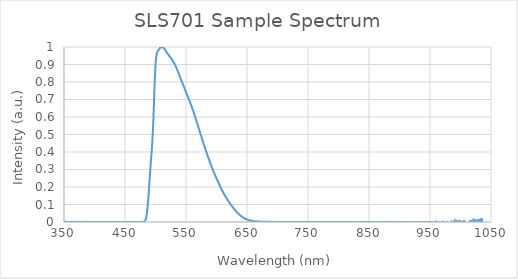
| Category | Intensity (a.u.) |
|---|---|
| 350.21 | 0 |
| 350.425 | 0.001 |
| 350.639 | 0.001 |
| 350.854 | 0.001 |
| 351.068 | 0 |
| 351.282 | 0.001 |
| 351.497 | 0.002 |
| 351.711 | 0.002 |
| 351.925 | 0.002 |
| 352.14 | 0.001 |
| 352.354 | 0.001 |
| 352.568 | 0 |
| 352.783 | 0 |
| 352.997 | 0 |
| 353.211 | 0.001 |
| 353.426 | 0.001 |
| 353.64 | 0.001 |
| 353.854 | 0.001 |
| 354.068 | 0.001 |
| 354.283 | 0.002 |
| 354.497 | 0.002 |
| 354.711 | 0.001 |
| 354.925 | 0.001 |
| 355.14 | 0 |
| 355.354 | 0.001 |
| 355.568 | 0 |
| 355.782 | 0 |
| 355.996 | 0 |
| 356.211 | 0 |
| 356.425 | 0 |
| 356.639 | 0.001 |
| 356.853 | 0.001 |
| 357.067 | 0 |
| 357.281 | 0 |
| 357.495 | 0 |
| 357.71 | 0 |
| 357.924 | 0 |
| 358.138 | 0.001 |
| 358.352 | 0.001 |
| 358.566 | 0.001 |
| 358.78 | 0 |
| 358.994 | 0 |
| 359.208 | 0 |
| 359.422 | 0 |
| 359.636 | 0 |
| 359.85 | 0 |
| 360.064 | 0 |
| 360.278 | 0.001 |
| 360.492 | 0.001 |
| 360.706 | 0.001 |
| 360.92 | 0.001 |
| 361.134 | 0.001 |
| 361.348 | 0.001 |
| 361.562 | 0 |
| 361.776 | 0 |
| 361.99 | 0 |
| 362.204 | -0.001 |
| 362.418 | 0 |
| 362.632 | 0 |
| 362.846 | 0 |
| 363.06 | 0.001 |
| 363.273 | 0 |
| 363.487 | 0 |
| 363.701 | 0 |
| 363.915 | 0.001 |
| 364.129 | 0.001 |
| 364.343 | 0.001 |
| 364.557 | 0 |
| 364.77 | 0 |
| 364.984 | 0.001 |
| 365.198 | 0.001 |
| 365.412 | 0.001 |
| 365.626 | 0 |
| 365.839 | -0.001 |
| 366.053 | 0 |
| 366.267 | 0 |
| 366.481 | 0.001 |
| 366.694 | 0.001 |
| 366.908 | 0.001 |
| 367.122 | 0 |
| 367.336 | 0.001 |
| 367.549 | 0.001 |
| 367.763 | 0.001 |
| 367.977 | 0 |
| 368.19 | 0.001 |
| 368.404 | 0.001 |
| 368.618 | 0.001 |
| 368.831 | 0 |
| 369.045 | 0.001 |
| 369.259 | 0 |
| 369.472 | 0 |
| 369.686 | 0 |
| 369.899 | 0 |
| 370.113 | 0 |
| 370.327 | 0.001 |
| 370.54 | 0.001 |
| 370.754 | 0.001 |
| 370.967 | 0.001 |
| 371.181 | 0.001 |
| 371.394 | 0.001 |
| 371.608 | 0.001 |
| 371.822 | 0.001 |
| 372.035 | 0.001 |
| 372.249 | 0.001 |
| 372.462 | 0.001 |
| 372.676 | 0 |
| 372.889 | 0 |
| 373.103 | 0 |
| 373.316 | 0 |
| 373.529 | 0.001 |
| 373.743 | 0 |
| 373.956 | 0 |
| 374.17 | 0 |
| 374.383 | 0.001 |
| 374.597 | 0.001 |
| 374.81 | 0.001 |
| 375.023 | 0.001 |
| 375.237 | 0.001 |
| 375.45 | 0.001 |
| 375.663 | 0 |
| 375.877 | 0 |
| 376.09 | 0 |
| 376.304 | 0 |
| 376.517 | 0.001 |
| 376.73 | 0.001 |
| 376.944 | 0 |
| 377.157 | 0 |
| 377.37 | 0 |
| 377.583 | 0 |
| 377.797 | 0.001 |
| 378.01 | 0.001 |
| 378.223 | 0.001 |
| 378.436 | 0 |
| 378.65 | 0 |
| 378.863 | -0.001 |
| 379.076 | -0.001 |
| 379.289 | 0 |
| 379.503 | 0 |
| 379.716 | 0 |
| 379.929 | -0.001 |
| 380.142 | 0 |
| 380.355 | 0 |
| 380.568 | 0 |
| 380.782 | -0.001 |
| 380.995 | -0.001 |
| 381.208 | 0 |
| 381.421 | 0 |
| 381.634 | 0 |
| 381.847 | 0 |
| 382.06 | 0 |
| 382.273 | 0.001 |
| 382.486 | 0.001 |
| 382.699 | 0.001 |
| 382.913 | 0.001 |
| 383.126 | 0 |
| 383.339 | -0.001 |
| 383.552 | 0 |
| 383.765 | 0 |
| 383.978 | 0 |
| 384.191 | 0.001 |
| 384.404 | 0.001 |
| 384.617 | 0.001 |
| 384.83 | 0 |
| 385.043 | 0 |
| 385.256 | 0.001 |
| 385.468 | 0.001 |
| 385.681 | 0 |
| 385.894 | 0 |
| 386.107 | 0 |
| 386.32 | 0.001 |
| 386.533 | 0.001 |
| 386.746 | 0 |
| 386.959 | 0 |
| 387.172 | 0 |
| 387.385 | 0 |
| 387.597 | 0.001 |
| 387.81 | 0.001 |
| 388.023 | 0.001 |
| 388.236 | 0.001 |
| 388.449 | 0 |
| 388.662 | 0 |
| 388.874 | 0 |
| 389.087 | 0.001 |
| 389.3 | 0.001 |
| 389.513 | 0.001 |
| 389.725 | 0.001 |
| 389.938 | 0 |
| 390.151 | 0.001 |
| 390.364 | 0 |
| 390.576 | 0 |
| 390.789 | 0 |
| 391.002 | 0 |
| 391.215 | 0 |
| 391.427 | 0 |
| 391.64 | 0 |
| 391.853 | 0 |
| 392.065 | 0 |
| 392.278 | 0.001 |
| 392.491 | 0.001 |
| 392.703 | 0.001 |
| 392.916 | 0 |
| 393.128 | 0 |
| 393.341 | 0 |
| 393.554 | -0.001 |
| 393.766 | -0.001 |
| 393.979 | 0 |
| 394.191 | 0 |
| 394.404 | 0 |
| 394.616 | 0 |
| 394.829 | 0.001 |
| 395.041 | 0 |
| 395.254 | 0 |
| 395.466 | 0 |
| 395.679 | 0 |
| 395.891 | 0.001 |
| 396.104 | 0 |
| 396.316 | 0 |
| 396.529 | 0 |
| 396.741 | 0 |
| 396.954 | 0 |
| 397.166 | 0 |
| 397.379 | 0 |
| 397.591 | 0 |
| 397.803 | 0 |
| 398.016 | 0 |
| 398.228 | 0 |
| 398.441 | 0 |
| 398.653 | 0 |
| 398.865 | 0 |
| 399.078 | 0 |
| 399.29 | 0 |
| 399.502 | 0 |
| 399.715 | 0 |
| 399.927 | 0 |
| 400.139 | 0 |
| 400.352 | 0 |
| 400.564 | 0 |
| 400.776 | 0 |
| 400.988 | 0 |
| 401.201 | 0 |
| 401.413 | 0 |
| 401.625 | 0 |
| 401.837 | 0 |
| 402.05 | 0 |
| 402.262 | 0 |
| 402.474 | 0 |
| 402.686 | 0 |
| 402.898 | 0.001 |
| 403.111 | 0 |
| 403.323 | 0 |
| 403.535 | 0 |
| 403.747 | 0 |
| 403.959 | 0 |
| 404.171 | 0 |
| 404.383 | 0 |
| 404.595 | 0 |
| 404.808 | 0 |
| 405.02 | 0 |
| 405.232 | 0 |
| 405.444 | 0 |
| 405.656 | 0 |
| 405.868 | 0.001 |
| 406.08 | 0.001 |
| 406.292 | 0 |
| 406.504 | 0 |
| 406.716 | 0 |
| 406.928 | 0 |
| 407.14 | 0 |
| 407.352 | 0 |
| 407.564 | 0 |
| 407.776 | 0 |
| 407.988 | 0 |
| 408.2 | 0 |
| 408.412 | 0 |
| 408.624 | 0 |
| 408.835 | 0 |
| 409.047 | 0 |
| 409.259 | 0 |
| 409.471 | 0 |
| 409.683 | 0 |
| 409.895 | 0 |
| 410.107 | 0 |
| 410.319 | 0 |
| 410.53 | 0 |
| 410.742 | 0 |
| 410.954 | 0 |
| 411.166 | 0 |
| 411.378 | 0 |
| 411.589 | 0 |
| 411.801 | 0 |
| 412.013 | 0 |
| 412.225 | 0 |
| 412.436 | 0 |
| 412.648 | 0 |
| 412.86 | 0 |
| 413.072 | 0 |
| 413.283 | 0 |
| 413.495 | 0 |
| 413.707 | 0.001 |
| 413.918 | 0 |
| 414.13 | 0 |
| 414.342 | 0 |
| 414.553 | 0 |
| 414.765 | 0 |
| 414.977 | 0 |
| 415.188 | 0 |
| 415.4 | 0 |
| 415.611 | 0 |
| 415.823 | 0 |
| 416.035 | 0 |
| 416.246 | 0 |
| 416.458 | 0 |
| 416.669 | 0 |
| 416.881 | 0 |
| 417.092 | 0 |
| 417.304 | 0 |
| 417.515 | 0 |
| 417.727 | 0 |
| 417.938 | 0 |
| 418.15 | 0 |
| 418.361 | 0 |
| 418.573 | 0 |
| 418.784 | 0 |
| 418.996 | 0 |
| 419.207 | 0 |
| 419.419 | 0 |
| 419.63 | 0 |
| 419.841 | 0 |
| 420.053 | 0 |
| 420.264 | 0 |
| 420.475 | 0 |
| 420.687 | 0 |
| 420.898 | 0 |
| 421.11 | 0 |
| 421.321 | 0.001 |
| 421.532 | 0 |
| 421.744 | 0 |
| 421.955 | 0 |
| 422.166 | 0 |
| 422.377 | 0 |
| 422.589 | 0 |
| 422.8 | 0 |
| 423.011 | 0 |
| 423.222 | 0 |
| 423.434 | 0 |
| 423.645 | 0 |
| 423.856 | 0 |
| 424.067 | 0 |
| 424.279 | 0 |
| 424.49 | 0 |
| 424.701 | 0 |
| 424.912 | 0 |
| 425.123 | 0 |
| 425.334 | 0 |
| 425.545 | 0 |
| 425.757 | 0 |
| 425.968 | 0 |
| 426.179 | 0 |
| 426.39 | 0 |
| 426.601 | 0.001 |
| 426.812 | 0.001 |
| 427.023 | 0 |
| 427.234 | 0 |
| 427.445 | 0 |
| 427.656 | 0 |
| 427.867 | 0 |
| 428.078 | 0 |
| 428.289 | 0 |
| 428.5 | 0 |
| 428.711 | 0 |
| 428.922 | 0 |
| 429.133 | 0 |
| 429.344 | 0 |
| 429.555 | 0 |
| 429.766 | 0 |
| 429.977 | 0 |
| 430.188 | 0 |
| 430.399 | 0 |
| 430.61 | 0 |
| 430.821 | 0 |
| 431.031 | 0 |
| 431.242 | 0 |
| 431.453 | 0 |
| 431.664 | 0 |
| 431.875 | 0 |
| 432.086 | 0 |
| 432.297 | 0 |
| 432.507 | 0 |
| 432.718 | 0 |
| 432.929 | 0 |
| 433.14 | 0 |
| 433.35 | 0 |
| 433.561 | 0 |
| 433.772 | 0 |
| 433.983 | 0 |
| 434.193 | 0 |
| 434.404 | 0 |
| 434.615 | 0 |
| 434.826 | 0 |
| 435.036 | 0 |
| 435.247 | 0 |
| 435.458 | 0 |
| 435.668 | 0 |
| 435.879 | 0 |
| 436.09 | 0 |
| 436.3 | 0 |
| 436.511 | 0 |
| 436.721 | 0 |
| 436.932 | 0 |
| 437.143 | 0 |
| 437.353 | 0 |
| 437.564 | 0 |
| 437.774 | 0 |
| 437.985 | 0 |
| 438.195 | 0 |
| 438.406 | 0 |
| 438.616 | 0 |
| 438.827 | 0 |
| 439.037 | 0 |
| 439.248 | 0 |
| 439.458 | 0 |
| 439.669 | 0 |
| 439.879 | 0 |
| 440.09 | 0 |
| 440.3 | 0 |
| 440.51 | 0 |
| 440.721 | 0 |
| 440.931 | 0 |
| 441.142 | 0 |
| 441.352 | 0 |
| 441.562 | 0 |
| 441.773 | 0 |
| 441.983 | 0 |
| 442.193 | 0 |
| 442.404 | 0 |
| 442.614 | 0 |
| 442.824 | 0 |
| 443.035 | 0 |
| 443.245 | 0 |
| 443.455 | 0 |
| 443.666 | 0 |
| 443.876 | 0 |
| 444.086 | 0 |
| 444.296 | 0 |
| 444.507 | 0 |
| 444.717 | 0 |
| 444.927 | 0 |
| 445.137 | 0 |
| 445.347 | 0 |
| 445.558 | 0 |
| 445.768 | 0 |
| 445.978 | 0 |
| 446.188 | 0 |
| 446.398 | 0 |
| 446.608 | 0 |
| 446.818 | 0 |
| 447.028 | 0 |
| 447.239 | 0 |
| 447.449 | 0 |
| 447.659 | 0 |
| 447.869 | 0 |
| 448.079 | 0 |
| 448.289 | 0 |
| 448.499 | 0 |
| 448.709 | 0 |
| 448.919 | 0 |
| 449.129 | 0 |
| 449.339 | 0 |
| 449.549 | 0 |
| 449.759 | 0 |
| 449.969 | 0 |
| 450.179 | 0 |
| 450.389 | 0 |
| 450.599 | 0 |
| 450.809 | 0 |
| 451.018 | 0 |
| 451.228 | 0 |
| 451.438 | 0 |
| 451.648 | 0 |
| 451.858 | 0 |
| 452.068 | 0 |
| 452.278 | 0 |
| 452.487 | 0 |
| 452.697 | 0 |
| 452.907 | 0 |
| 453.117 | 0 |
| 453.327 | 0 |
| 453.536 | 0 |
| 453.746 | 0 |
| 453.956 | 0 |
| 454.166 | 0 |
| 454.376 | 0 |
| 454.585 | 0 |
| 454.795 | 0 |
| 455.005 | 0 |
| 455.214 | 0 |
| 455.424 | 0 |
| 455.634 | 0 |
| 455.843 | 0 |
| 456.053 | 0 |
| 456.263 | 0 |
| 456.472 | 0 |
| 456.682 | 0 |
| 456.892 | 0 |
| 457.101 | 0 |
| 457.311 | 0 |
| 457.52 | 0 |
| 457.73 | 0 |
| 457.939 | 0 |
| 458.149 | 0 |
| 458.359 | 0 |
| 458.568 | 0 |
| 458.778 | 0 |
| 458.987 | 0 |
| 459.197 | 0 |
| 459.406 | 0 |
| 459.616 | 0 |
| 459.825 | 0 |
| 460.034 | 0 |
| 460.244 | 0 |
| 460.453 | 0 |
| 460.663 | 0 |
| 460.872 | 0 |
| 461.082 | 0 |
| 461.291 | 0 |
| 461.5 | 0 |
| 461.71 | 0 |
| 461.919 | 0 |
| 462.128 | 0 |
| 462.338 | 0 |
| 462.547 | 0 |
| 462.756 | 0 |
| 462.966 | 0 |
| 463.175 | 0 |
| 463.384 | 0 |
| 463.594 | 0 |
| 463.803 | 0 |
| 464.012 | 0 |
| 464.221 | 0 |
| 464.431 | 0 |
| 464.64 | 0 |
| 464.849 | 0 |
| 465.058 | 0 |
| 465.267 | 0 |
| 465.477 | 0 |
| 465.686 | 0 |
| 465.895 | 0 |
| 466.104 | 0 |
| 466.313 | 0 |
| 466.522 | 0 |
| 466.731 | 0 |
| 466.941 | 0 |
| 467.15 | 0 |
| 467.359 | 0 |
| 467.568 | 0 |
| 467.777 | 0 |
| 467.986 | 0 |
| 468.195 | 0 |
| 468.404 | 0 |
| 468.613 | 0 |
| 468.822 | 0 |
| 469.031 | 0 |
| 469.24 | 0 |
| 469.449 | 0 |
| 469.658 | 0 |
| 469.867 | 0 |
| 470.076 | 0 |
| 470.285 | 0 |
| 470.494 | 0 |
| 470.703 | 0 |
| 470.912 | 0 |
| 471.12 | 0 |
| 471.329 | 0 |
| 471.538 | 0 |
| 471.747 | 0 |
| 471.956 | 0 |
| 472.165 | 0 |
| 472.374 | 0 |
| 472.582 | 0 |
| 472.791 | 0 |
| 473.0 | 0 |
| 473.209 | 0 |
| 473.417 | 0 |
| 473.626 | 0 |
| 473.835 | 0 |
| 474.044 | 0 |
| 474.252 | 0 |
| 474.461 | 0 |
| 474.67 | 0 |
| 474.879 | 0 |
| 475.087 | 0 |
| 475.296 | 0 |
| 475.505 | 0 |
| 475.713 | 0 |
| 475.922 | 0 |
| 476.131 | 0 |
| 476.339 | 0 |
| 476.548 | 0 |
| 476.756 | 0 |
| 476.965 | 0 |
| 477.174 | 0 |
| 477.382 | 0 |
| 477.591 | 0 |
| 477.799 | 0 |
| 478.008 | 0 |
| 478.216 | 0.001 |
| 478.425 | 0.001 |
| 478.633 | 0.001 |
| 478.842 | 0.001 |
| 479.05 | 0.001 |
| 479.259 | 0.001 |
| 479.467 | 0.001 |
| 479.676 | 0.001 |
| 479.884 | 0.001 |
| 480.092 | 0.001 |
| 480.301 | 0.002 |
| 480.509 | 0.002 |
| 480.718 | 0.002 |
| 480.926 | 0.002 |
| 481.134 | 0.003 |
| 481.343 | 0.003 |
| 481.551 | 0.003 |
| 481.759 | 0.004 |
| 481.968 | 0.004 |
| 482.176 | 0.005 |
| 482.384 | 0.005 |
| 482.593 | 0.006 |
| 482.801 | 0.007 |
| 483.009 | 0.008 |
| 483.218 | 0.009 |
| 483.426 | 0.011 |
| 483.634 | 0.012 |
| 483.842 | 0.015 |
| 484.05 | 0.017 |
| 484.259 | 0.02 |
| 484.467 | 0.022 |
| 484.675 | 0.025 |
| 484.883 | 0.028 |
| 485.091 | 0.033 |
| 485.3 | 0.037 |
| 485.508 | 0.042 |
| 485.716 | 0.046 |
| 485.924 | 0.052 |
| 486.132 | 0.058 |
| 486.34 | 0.064 |
| 486.548 | 0.07 |
| 486.756 | 0.078 |
| 486.964 | 0.085 |
| 487.172 | 0.092 |
| 487.38 | 0.1 |
| 487.588 | 0.108 |
| 487.796 | 0.117 |
| 488.004 | 0.126 |
| 488.212 | 0.135 |
| 488.42 | 0.145 |
| 488.628 | 0.154 |
| 488.836 | 0.164 |
| 489.044 | 0.174 |
| 489.252 | 0.185 |
| 489.46 | 0.195 |
| 489.668 | 0.207 |
| 489.876 | 0.217 |
| 490.084 | 0.228 |
| 490.292 | 0.238 |
| 490.5 | 0.249 |
| 490.708 | 0.261 |
| 490.915 | 0.271 |
| 491.123 | 0.282 |
| 491.331 | 0.293 |
| 491.539 | 0.303 |
| 491.747 | 0.314 |
| 491.954 | 0.323 |
| 492.162 | 0.333 |
| 492.37 | 0.342 |
| 492.578 | 0.352 |
| 492.786 | 0.361 |
| 492.993 | 0.372 |
| 493.201 | 0.381 |
| 493.409 | 0.39 |
| 493.616 | 0.401 |
| 493.824 | 0.41 |
| 494.032 | 0.421 |
| 494.239 | 0.431 |
| 494.447 | 0.442 |
| 494.655 | 0.452 |
| 494.862 | 0.464 |
| 495.07 | 0.478 |
| 495.278 | 0.49 |
| 495.485 | 0.504 |
| 495.693 | 0.52 |
| 495.9 | 0.535 |
| 496.108 | 0.552 |
| 496.316 | 0.569 |
| 496.523 | 0.586 |
| 496.731 | 0.606 |
| 496.938 | 0.626 |
| 497.146 | 0.647 |
| 497.353 | 0.666 |
| 497.561 | 0.687 |
| 497.768 | 0.709 |
| 497.976 | 0.728 |
| 498.183 | 0.751 |
| 498.391 | 0.771 |
| 498.598 | 0.789 |
| 498.805 | 0.808 |
| 499.013 | 0.824 |
| 499.22 | 0.845 |
| 499.428 | 0.857 |
| 499.635 | 0.873 |
| 499.842 | 0.884 |
| 500.05 | 0.896 |
| 500.257 | 0.909 |
| 500.464 | 0.919 |
| 500.672 | 0.927 |
| 500.879 | 0.935 |
| 501.086 | 0.942 |
| 501.294 | 0.944 |
| 501.501 | 0.949 |
| 501.708 | 0.954 |
| 501.915 | 0.96 |
| 502.123 | 0.962 |
| 502.33 | 0.963 |
| 502.537 | 0.967 |
| 502.744 | 0.967 |
| 502.952 | 0.969 |
| 503.159 | 0.971 |
| 503.366 | 0.971 |
| 503.573 | 0.977 |
| 503.78 | 0.977 |
| 503.987 | 0.977 |
| 504.195 | 0.976 |
| 504.402 | 0.979 |
| 504.609 | 0.98 |
| 504.816 | 0.981 |
| 505.023 | 0.983 |
| 505.23 | 0.986 |
| 505.437 | 0.986 |
| 505.644 | 0.987 |
| 505.851 | 0.987 |
| 506.058 | 0.988 |
| 506.265 | 0.988 |
| 506.472 | 0.988 |
| 506.679 | 0.99 |
| 506.886 | 0.991 |
| 507.093 | 0.991 |
| 507.3 | 0.993 |
| 507.507 | 0.996 |
| 507.714 | 0.996 |
| 507.921 | 0.994 |
| 508.128 | 0.993 |
| 508.335 | 0.993 |
| 508.542 | 0.995 |
| 508.749 | 0.998 |
| 508.955 | 0.999 |
| 509.162 | 0.999 |
| 509.369 | 0.998 |
| 509.576 | 0.999 |
| 509.783 | 0.997 |
| 509.99 | 0.996 |
| 510.196 | 0.997 |
| 510.403 | 0.999 |
| 510.61 | 0.998 |
| 510.817 | 0.999 |
| 511.023 | 1 |
| 511.23 | 0.999 |
| 511.437 | 0.997 |
| 511.644 | 0.996 |
| 511.85 | 0.996 |
| 512.057 | 0.998 |
| 512.264 | 0.999 |
| 512.47 | 1 |
| 512.677 | 0.998 |
| 512.884 | 0.998 |
| 513.09 | 0.995 |
| 513.297 | 0.994 |
| 513.504 | 0.992 |
| 513.71 | 0.994 |
| 513.917 | 0.994 |
| 514.123 | 0.994 |
| 514.33 | 0.993 |
| 514.537 | 0.989 |
| 514.743 | 0.989 |
| 514.95 | 0.988 |
| 515.156 | 0.989 |
| 515.363 | 0.986 |
| 515.569 | 0.988 |
| 515.776 | 0.984 |
| 515.982 | 0.985 |
| 516.189 | 0.983 |
| 516.395 | 0.982 |
| 516.601 | 0.981 |
| 516.808 | 0.979 |
| 517.014 | 0.977 |
| 517.221 | 0.977 |
| 517.427 | 0.977 |
| 517.634 | 0.977 |
| 517.84 | 0.973 |
| 518.046 | 0.972 |
| 518.253 | 0.97 |
| 518.459 | 0.968 |
| 518.665 | 0.967 |
| 518.872 | 0.966 |
| 519.078 | 0.967 |
| 519.284 | 0.967 |
| 519.49 | 0.964 |
| 519.697 | 0.963 |
| 519.903 | 0.961 |
| 520.109 | 0.96 |
| 520.315 | 0.958 |
| 520.522 | 0.958 |
| 520.728 | 0.956 |
| 520.934 | 0.957 |
| 521.14 | 0.957 |
| 521.346 | 0.956 |
| 521.553 | 0.955 |
| 521.759 | 0.952 |
| 521.965 | 0.951 |
| 522.171 | 0.949 |
| 522.377 | 0.95 |
| 522.583 | 0.948 |
| 522.789 | 0.946 |
| 522.995 | 0.947 |
| 523.202 | 0.946 |
| 523.408 | 0.946 |
| 523.614 | 0.946 |
| 523.82 | 0.942 |
| 524.026 | 0.943 |
| 524.232 | 0.94 |
| 524.438 | 0.942 |
| 524.644 | 0.94 |
| 524.85 | 0.939 |
| 525.056 | 0.94 |
| 525.262 | 0.938 |
| 525.468 | 0.937 |
| 525.673 | 0.938 |
| 525.879 | 0.936 |
| 526.085 | 0.933 |
| 526.291 | 0.932 |
| 526.497 | 0.931 |
| 526.703 | 0.931 |
| 526.909 | 0.93 |
| 527.115 | 0.93 |
| 527.32 | 0.927 |
| 527.526 | 0.926 |
| 527.732 | 0.927 |
| 527.938 | 0.925 |
| 528.144 | 0.923 |
| 528.349 | 0.921 |
| 528.555 | 0.922 |
| 528.761 | 0.918 |
| 528.967 | 0.92 |
| 529.172 | 0.918 |
| 529.378 | 0.916 |
| 529.584 | 0.915 |
| 529.79 | 0.914 |
| 529.995 | 0.913 |
| 530.201 | 0.91 |
| 530.407 | 0.911 |
| 530.612 | 0.911 |
| 530.818 | 0.907 |
| 531.023 | 0.907 |
| 531.229 | 0.905 |
| 531.435 | 0.904 |
| 531.64 | 0.901 |
| 531.846 | 0.9 |
| 532.051 | 0.898 |
| 532.257 | 0.896 |
| 532.462 | 0.896 |
| 532.668 | 0.895 |
| 532.874 | 0.892 |
| 533.079 | 0.892 |
| 533.285 | 0.889 |
| 533.49 | 0.889 |
| 533.695 | 0.885 |
| 533.901 | 0.886 |
| 534.106 | 0.884 |
| 534.312 | 0.882 |
| 534.517 | 0.879 |
| 534.723 | 0.878 |
| 534.928 | 0.875 |
| 535.133 | 0.875 |
| 535.339 | 0.871 |
| 535.544 | 0.871 |
| 535.749 | 0.868 |
| 535.955 | 0.866 |
| 536.16 | 0.866 |
| 536.365 | 0.864 |
| 536.571 | 0.862 |
| 536.776 | 0.86 |
| 536.981 | 0.857 |
| 537.187 | 0.857 |
| 537.392 | 0.853 |
| 537.597 | 0.853 |
| 537.802 | 0.849 |
| 538.008 | 0.85 |
| 538.213 | 0.848 |
| 538.418 | 0.847 |
| 538.623 | 0.844 |
| 538.828 | 0.841 |
| 539.033 | 0.839 |
| 539.239 | 0.837 |
| 539.444 | 0.836 |
| 539.649 | 0.834 |
| 539.854 | 0.832 |
| 540.059 | 0.831 |
| 540.264 | 0.828 |
| 540.469 | 0.826 |
| 540.674 | 0.824 |
| 540.879 | 0.823 |
| 541.084 | 0.82 |
| 541.289 | 0.82 |
| 541.494 | 0.817 |
| 541.699 | 0.816 |
| 541.904 | 0.812 |
| 542.109 | 0.811 |
| 542.314 | 0.809 |
| 542.519 | 0.809 |
| 542.724 | 0.807 |
| 542.929 | 0.805 |
| 543.134 | 0.804 |
| 543.339 | 0.8 |
| 543.544 | 0.798 |
| 543.749 | 0.796 |
| 543.954 | 0.796 |
| 544.158 | 0.795 |
| 544.363 | 0.793 |
| 544.568 | 0.792 |
| 544.773 | 0.788 |
| 544.978 | 0.788 |
| 545.183 | 0.785 |
| 545.387 | 0.784 |
| 545.592 | 0.781 |
| 545.797 | 0.78 |
| 546.002 | 0.78 |
| 546.206 | 0.778 |
| 546.411 | 0.775 |
| 546.616 | 0.773 |
| 546.82 | 0.771 |
| 547.025 | 0.77 |
| 547.23 | 0.767 |
| 547.434 | 0.766 |
| 547.639 | 0.764 |
| 547.844 | 0.762 |
| 548.048 | 0.759 |
| 548.253 | 0.758 |
| 548.458 | 0.755 |
| 548.662 | 0.754 |
| 548.867 | 0.752 |
| 549.071 | 0.75 |
| 549.276 | 0.749 |
| 549.48 | 0.746 |
| 549.685 | 0.745 |
| 549.889 | 0.741 |
| 550.094 | 0.74 |
| 550.298 | 0.738 |
| 550.503 | 0.736 |
| 550.707 | 0.734 |
| 550.912 | 0.733 |
| 551.116 | 0.733 |
| 551.321 | 0.73 |
| 551.525 | 0.728 |
| 551.73 | 0.725 |
| 551.934 | 0.724 |
| 552.138 | 0.722 |
| 552.343 | 0.721 |
| 552.547 | 0.718 |
| 552.751 | 0.718 |
| 552.956 | 0.715 |
| 553.16 | 0.715 |
| 553.364 | 0.711 |
| 553.569 | 0.71 |
| 553.773 | 0.709 |
| 553.977 | 0.708 |
| 554.181 | 0.707 |
| 554.386 | 0.703 |
| 554.59 | 0.701 |
| 554.794 | 0.699 |
| 554.998 | 0.697 |
| 555.203 | 0.697 |
| 555.407 | 0.696 |
| 555.611 | 0.694 |
| 555.815 | 0.692 |
| 556.019 | 0.69 |
| 556.223 | 0.688 |
| 556.427 | 0.686 |
| 556.632 | 0.684 |
| 556.836 | 0.682 |
| 557.04 | 0.681 |
| 557.244 | 0.679 |
| 557.448 | 0.676 |
| 557.652 | 0.676 |
| 557.856 | 0.671 |
| 558.06 | 0.672 |
| 558.264 | 0.667 |
| 558.468 | 0.667 |
| 558.672 | 0.665 |
| 558.876 | 0.665 |
| 559.08 | 0.662 |
| 559.284 | 0.66 |
| 559.488 | 0.657 |
| 559.692 | 0.655 |
| 559.896 | 0.651 |
| 560.1 | 0.651 |
| 560.303 | 0.65 |
| 560.507 | 0.648 |
| 560.711 | 0.646 |
| 560.915 | 0.644 |
| 561.119 | 0.641 |
| 561.323 | 0.639 |
| 561.527 | 0.638 |
| 561.73 | 0.637 |
| 561.934 | 0.634 |
| 562.138 | 0.631 |
| 562.342 | 0.629 |
| 562.545 | 0.628 |
| 562.749 | 0.626 |
| 562.953 | 0.622 |
| 563.157 | 0.62 |
| 563.36 | 0.617 |
| 563.564 | 0.616 |
| 563.768 | 0.613 |
| 563.971 | 0.611 |
| 564.175 | 0.61 |
| 564.379 | 0.607 |
| 564.582 | 0.606 |
| 564.786 | 0.604 |
| 564.989 | 0.602 |
| 565.193 | 0.598 |
| 565.397 | 0.596 |
| 565.6 | 0.593 |
| 565.804 | 0.592 |
| 566.007 | 0.591 |
| 566.211 | 0.587 |
| 566.414 | 0.586 |
| 566.618 | 0.582 |
| 566.821 | 0.581 |
| 567.025 | 0.579 |
| 567.228 | 0.576 |
| 567.432 | 0.576 |
| 567.635 | 0.569 |
| 567.839 | 0.569 |
| 568.042 | 0.565 |
| 568.245 | 0.565 |
| 568.449 | 0.563 |
| 568.652 | 0.561 |
| 568.855 | 0.56 |
| 569.059 | 0.556 |
| 569.262 | 0.554 |
| 569.466 | 0.551 |
| 569.669 | 0.549 |
| 569.872 | 0.548 |
| 570.075 | 0.545 |
| 570.279 | 0.543 |
| 570.482 | 0.539 |
| 570.685 | 0.537 |
| 570.888 | 0.535 |
| 571.092 | 0.534 |
| 571.295 | 0.532 |
| 571.498 | 0.529 |
| 571.701 | 0.527 |
| 571.904 | 0.524 |
| 572.108 | 0.521 |
| 572.311 | 0.519 |
| 572.514 | 0.517 |
| 572.717 | 0.516 |
| 572.92 | 0.514 |
| 573.123 | 0.511 |
| 573.326 | 0.508 |
| 573.529 | 0.505 |
| 573.732 | 0.504 |
| 573.935 | 0.502 |
| 574.139 | 0.5 |
| 574.342 | 0.497 |
| 574.545 | 0.495 |
| 574.748 | 0.492 |
| 574.951 | 0.49 |
| 575.154 | 0.489 |
| 575.356 | 0.487 |
| 575.559 | 0.485 |
| 575.762 | 0.483 |
| 575.965 | 0.48 |
| 576.168 | 0.477 |
| 576.371 | 0.475 |
| 576.574 | 0.473 |
| 576.777 | 0.471 |
| 576.98 | 0.468 |
| 577.183 | 0.466 |
| 577.385 | 0.464 |
| 577.588 | 0.462 |
| 577.791 | 0.459 |
| 577.994 | 0.457 |
| 578.197 | 0.455 |
| 578.399 | 0.453 |
| 578.602 | 0.451 |
| 578.805 | 0.449 |
| 579.008 | 0.445 |
| 579.21 | 0.445 |
| 579.413 | 0.442 |
| 579.616 | 0.441 |
| 579.818 | 0.437 |
| 580.021 | 0.436 |
| 580.224 | 0.433 |
| 580.426 | 0.431 |
| 580.629 | 0.429 |
| 580.832 | 0.428 |
| 581.034 | 0.425 |
| 581.237 | 0.423 |
| 581.439 | 0.42 |
| 581.642 | 0.418 |
| 581.844 | 0.415 |
| 582.047 | 0.414 |
| 582.25 | 0.411 |
| 582.452 | 0.409 |
| 582.655 | 0.406 |
| 582.857 | 0.406 |
| 583.06 | 0.403 |
| 583.262 | 0.403 |
| 583.464 | 0.399 |
| 583.667 | 0.397 |
| 583.869 | 0.394 |
| 584.072 | 0.393 |
| 584.274 | 0.39 |
| 584.476 | 0.388 |
| 584.679 | 0.387 |
| 584.881 | 0.384 |
| 585.084 | 0.382 |
| 585.286 | 0.38 |
| 585.488 | 0.378 |
| 585.691 | 0.377 |
| 585.893 | 0.374 |
| 586.095 | 0.373 |
| 586.297 | 0.37 |
| 586.5 | 0.368 |
| 586.702 | 0.366 |
| 586.904 | 0.364 |
| 587.106 | 0.362 |
| 587.309 | 0.359 |
| 587.511 | 0.357 |
| 587.713 | 0.356 |
| 587.915 | 0.354 |
| 588.117 | 0.352 |
| 588.319 | 0.35 |
| 588.521 | 0.348 |
| 588.724 | 0.347 |
| 588.926 | 0.344 |
| 589.128 | 0.342 |
| 589.33 | 0.341 |
| 589.532 | 0.339 |
| 589.734 | 0.338 |
| 589.936 | 0.335 |
| 590.138 | 0.333 |
| 590.34 | 0.331 |
| 590.542 | 0.33 |
| 590.744 | 0.327 |
| 590.946 | 0.326 |
| 591.148 | 0.324 |
| 591.35 | 0.323 |
| 591.552 | 0.32 |
| 591.754 | 0.319 |
| 591.956 | 0.317 |
| 592.158 | 0.315 |
| 592.359 | 0.313 |
| 592.561 | 0.311 |
| 592.763 | 0.31 |
| 592.965 | 0.308 |
| 593.167 | 0.306 |
| 593.369 | 0.304 |
| 593.57 | 0.302 |
| 593.772 | 0.3 |
| 593.974 | 0.3 |
| 594.176 | 0.298 |
| 594.378 | 0.296 |
| 594.579 | 0.294 |
| 594.781 | 0.292 |
| 594.983 | 0.291 |
| 595.184 | 0.288 |
| 595.386 | 0.287 |
| 595.588 | 0.285 |
| 595.789 | 0.285 |
| 595.991 | 0.283 |
| 596.193 | 0.281 |
| 596.394 | 0.279 |
| 596.596 | 0.277 |
| 596.798 | 0.275 |
| 596.999 | 0.274 |
| 597.201 | 0.272 |
| 597.402 | 0.271 |
| 597.604 | 0.269 |
| 597.805 | 0.268 |
| 598.007 | 0.266 |
| 598.208 | 0.264 |
| 598.41 | 0.262 |
| 598.611 | 0.261 |
| 598.813 | 0.259 |
| 599.014 | 0.257 |
| 599.216 | 0.255 |
| 599.417 | 0.254 |
| 599.618 | 0.252 |
| 599.82 | 0.251 |
| 600.021 | 0.249 |
| 600.223 | 0.247 |
| 600.424 | 0.246 |
| 600.625 | 0.245 |
| 600.827 | 0.243 |
| 601.028 | 0.241 |
| 601.229 | 0.239 |
| 601.431 | 0.238 |
| 601.632 | 0.236 |
| 601.833 | 0.235 |
| 602.034 | 0.233 |
| 602.236 | 0.232 |
| 602.437 | 0.23 |
| 602.638 | 0.229 |
| 602.839 | 0.227 |
| 603.04 | 0.226 |
| 603.242 | 0.224 |
| 603.443 | 0.222 |
| 603.644 | 0.22 |
| 603.845 | 0.219 |
| 604.046 | 0.218 |
| 604.247 | 0.217 |
| 604.448 | 0.215 |
| 604.649 | 0.213 |
| 604.851 | 0.212 |
| 605.052 | 0.211 |
| 605.253 | 0.209 |
| 605.454 | 0.207 |
| 605.655 | 0.206 |
| 605.856 | 0.204 |
| 606.057 | 0.203 |
| 606.258 | 0.202 |
| 606.459 | 0.2 |
| 606.66 | 0.198 |
| 606.86 | 0.197 |
| 607.061 | 0.196 |
| 607.262 | 0.194 |
| 607.463 | 0.193 |
| 607.664 | 0.191 |
| 607.865 | 0.191 |
| 608.066 | 0.188 |
| 608.267 | 0.187 |
| 608.467 | 0.185 |
| 608.668 | 0.185 |
| 608.869 | 0.183 |
| 609.07 | 0.181 |
| 609.271 | 0.18 |
| 609.471 | 0.179 |
| 609.672 | 0.177 |
| 609.873 | 0.176 |
| 610.074 | 0.175 |
| 610.274 | 0.173 |
| 610.475 | 0.173 |
| 610.676 | 0.171 |
| 610.876 | 0.17 |
| 611.077 | 0.169 |
| 611.278 | 0.167 |
| 611.478 | 0.166 |
| 611.679 | 0.164 |
| 611.88 | 0.163 |
| 612.08 | 0.162 |
| 612.281 | 0.161 |
| 612.481 | 0.16 |
| 612.682 | 0.158 |
| 612.882 | 0.157 |
| 613.083 | 0.156 |
| 613.283 | 0.155 |
| 613.484 | 0.154 |
| 613.684 | 0.152 |
| 613.885 | 0.151 |
| 614.085 | 0.149 |
| 614.286 | 0.149 |
| 614.486 | 0.148 |
| 614.687 | 0.146 |
| 614.887 | 0.145 |
| 615.087 | 0.144 |
| 615.288 | 0.143 |
| 615.488 | 0.142 |
| 615.688 | 0.141 |
| 615.889 | 0.14 |
| 616.089 | 0.139 |
| 616.289 | 0.138 |
| 616.49 | 0.136 |
| 616.69 | 0.135 |
| 616.89 | 0.134 |
| 617.09 | 0.133 |
| 617.291 | 0.131 |
| 617.491 | 0.131 |
| 617.691 | 0.13 |
| 617.891 | 0.128 |
| 618.092 | 0.127 |
| 618.292 | 0.126 |
| 618.492 | 0.125 |
| 618.692 | 0.124 |
| 618.892 | 0.123 |
| 619.092 | 0.122 |
| 619.292 | 0.121 |
| 619.492 | 0.12 |
| 619.693 | 0.118 |
| 619.893 | 0.118 |
| 620.093 | 0.117 |
| 620.293 | 0.116 |
| 620.493 | 0.115 |
| 620.693 | 0.114 |
| 620.893 | 0.112 |
| 621.093 | 0.112 |
| 621.293 | 0.11 |
| 621.493 | 0.11 |
| 621.693 | 0.108 |
| 621.893 | 0.107 |
| 622.092 | 0.106 |
| 622.292 | 0.105 |
| 622.492 | 0.104 |
| 622.692 | 0.103 |
| 622.892 | 0.102 |
| 623.092 | 0.101 |
| 623.292 | 0.1 |
| 623.491 | 0.1 |
| 623.691 | 0.098 |
| 623.891 | 0.097 |
| 624.091 | 0.096 |
| 624.291 | 0.095 |
| 624.49 | 0.094 |
| 624.69 | 0.093 |
| 624.89 | 0.093 |
| 625.09 | 0.092 |
| 625.289 | 0.091 |
| 625.489 | 0.091 |
| 625.689 | 0.089 |
| 625.888 | 0.088 |
| 626.088 | 0.087 |
| 626.288 | 0.086 |
| 626.487 | 0.085 |
| 626.687 | 0.084 |
| 626.886 | 0.083 |
| 627.086 | 0.083 |
| 627.285 | 0.082 |
| 627.485 | 0.081 |
| 627.685 | 0.08 |
| 627.884 | 0.079 |
| 628.084 | 0.078 |
| 628.283 | 0.078 |
| 628.483 | 0.077 |
| 628.682 | 0.076 |
| 628.881 | 0.075 |
| 629.081 | 0.074 |
| 629.28 | 0.074 |
| 629.48 | 0.073 |
| 629.679 | 0.071 |
| 629.879 | 0.071 |
| 630.078 | 0.07 |
| 630.277 | 0.069 |
| 630.477 | 0.068 |
| 630.676 | 0.067 |
| 630.875 | 0.066 |
| 631.075 | 0.066 |
| 631.274 | 0.065 |
| 631.473 | 0.064 |
| 631.672 | 0.063 |
| 631.872 | 0.063 |
| 632.071 | 0.061 |
| 632.27 | 0.061 |
| 632.469 | 0.06 |
| 632.668 | 0.059 |
| 632.868 | 0.058 |
| 633.067 | 0.058 |
| 633.266 | 0.057 |
| 633.465 | 0.056 |
| 633.664 | 0.055 |
| 633.863 | 0.055 |
| 634.062 | 0.054 |
| 634.261 | 0.053 |
| 634.461 | 0.052 |
| 634.66 | 0.052 |
| 634.859 | 0.051 |
| 635.058 | 0.05 |
| 635.257 | 0.05 |
| 635.456 | 0.049 |
| 635.655 | 0.048 |
| 635.854 | 0.048 |
| 636.053 | 0.047 |
| 636.252 | 0.047 |
| 636.45 | 0.045 |
| 636.649 | 0.045 |
| 636.848 | 0.044 |
| 637.047 | 0.044 |
| 637.246 | 0.043 |
| 637.445 | 0.042 |
| 637.644 | 0.042 |
| 637.843 | 0.041 |
| 638.041 | 0.041 |
| 638.24 | 0.04 |
| 638.439 | 0.039 |
| 638.638 | 0.039 |
| 638.837 | 0.038 |
| 639.035 | 0.038 |
| 639.234 | 0.037 |
| 639.433 | 0.036 |
| 639.631 | 0.036 |
| 639.83 | 0.035 |
| 640.029 | 0.035 |
| 640.227 | 0.034 |
| 640.426 | 0.033 |
| 640.625 | 0.033 |
| 640.823 | 0.032 |
| 641.022 | 0.032 |
| 641.221 | 0.031 |
| 641.419 | 0.031 |
| 641.618 | 0.03 |
| 641.816 | 0.03 |
| 642.015 | 0.029 |
| 642.213 | 0.029 |
| 642.412 | 0.028 |
| 642.61 | 0.028 |
| 642.809 | 0.027 |
| 643.007 | 0.027 |
| 643.206 | 0.027 |
| 643.404 | 0.026 |
| 643.603 | 0.026 |
| 643.801 | 0.025 |
| 643.999 | 0.025 |
| 644.198 | 0.025 |
| 644.396 | 0.024 |
| 644.595 | 0.024 |
| 644.793 | 0.023 |
| 644.991 | 0.023 |
| 645.19 | 0.023 |
| 645.388 | 0.022 |
| 645.586 | 0.022 |
| 645.784 | 0.021 |
| 645.983 | 0.021 |
| 646.181 | 0.021 |
| 646.379 | 0.02 |
| 646.577 | 0.02 |
| 646.776 | 0.02 |
| 646.974 | 0.019 |
| 647.172 | 0.019 |
| 647.37 | 0.018 |
| 647.568 | 0.018 |
| 647.766 | 0.018 |
| 647.965 | 0.018 |
| 648.163 | 0.017 |
| 648.361 | 0.017 |
| 648.559 | 0.017 |
| 648.757 | 0.016 |
| 648.955 | 0.016 |
| 649.153 | 0.016 |
| 649.351 | 0.015 |
| 649.549 | 0.015 |
| 649.747 | 0.015 |
| 649.945 | 0.014 |
| 650.143 | 0.014 |
| 650.341 | 0.014 |
| 650.539 | 0.014 |
| 650.737 | 0.013 |
| 650.935 | 0.013 |
| 651.133 | 0.013 |
| 651.33 | 0.013 |
| 651.528 | 0.012 |
| 651.726 | 0.012 |
| 651.924 | 0.012 |
| 652.122 | 0.012 |
| 652.32 | 0.012 |
| 652.517 | 0.011 |
| 652.715 | 0.011 |
| 652.913 | 0.011 |
| 653.111 | 0.011 |
| 653.308 | 0.01 |
| 653.506 | 0.01 |
| 653.704 | 0.01 |
| 653.902 | 0.01 |
| 654.099 | 0.01 |
| 654.297 | 0.009 |
| 654.495 | 0.009 |
| 654.692 | 0.009 |
| 654.89 | 0.009 |
| 655.088 | 0.009 |
| 655.285 | 0.009 |
| 655.483 | 0.009 |
| 655.68 | 0.008 |
| 655.878 | 0.008 |
| 656.075 | 0.008 |
| 656.273 | 0.008 |
| 656.47 | 0.008 |
| 656.668 | 0.008 |
| 656.865 | 0.008 |
| 657.063 | 0.007 |
| 657.26 | 0.007 |
| 657.458 | 0.007 |
| 657.655 | 0.007 |
| 657.853 | 0.007 |
| 658.05 | 0.007 |
| 658.247 | 0.007 |
| 658.445 | 0.007 |
| 658.642 | 0.006 |
| 658.839 | 0.006 |
| 659.037 | 0.006 |
| 659.234 | 0.006 |
| 659.431 | 0.006 |
| 659.629 | 0.006 |
| 659.826 | 0.006 |
| 660.023 | 0.006 |
| 660.22 | 0.005 |
| 660.418 | 0.005 |
| 660.615 | 0.005 |
| 660.812 | 0.005 |
| 661.009 | 0.005 |
| 661.206 | 0.005 |
| 661.404 | 0.005 |
| 661.601 | 0.005 |
| 661.798 | 0.005 |
| 661.995 | 0.005 |
| 662.192 | 0.005 |
| 662.389 | 0.005 |
| 662.586 | 0.004 |
| 662.783 | 0.004 |
| 662.98 | 0.004 |
| 663.177 | 0.004 |
| 663.374 | 0.004 |
| 663.571 | 0.004 |
| 663.768 | 0.004 |
| 663.965 | 0.004 |
| 664.162 | 0.004 |
| 664.359 | 0.004 |
| 664.556 | 0.004 |
| 664.753 | 0.004 |
| 664.95 | 0.004 |
| 665.147 | 0.004 |
| 665.344 | 0.003 |
| 665.541 | 0.004 |
| 665.737 | 0.003 |
| 665.934 | 0.003 |
| 666.131 | 0.003 |
| 666.328 | 0.003 |
| 666.525 | 0.003 |
| 666.721 | 0.003 |
| 666.918 | 0.003 |
| 667.115 | 0.003 |
| 667.312 | 0.003 |
| 667.508 | 0.003 |
| 667.705 | 0.003 |
| 667.902 | 0.003 |
| 668.098 | 0.003 |
| 668.295 | 0.003 |
| 668.492 | 0.003 |
| 668.688 | 0.003 |
| 668.885 | 0.003 |
| 669.081 | 0.003 |
| 669.278 | 0.003 |
| 669.475 | 0.003 |
| 669.671 | 0.002 |
| 669.868 | 0.002 |
| 670.064 | 0.002 |
| 670.261 | 0.002 |
| 670.457 | 0.002 |
| 670.654 | 0.002 |
| 670.85 | 0.002 |
| 671.047 | 0.002 |
| 671.243 | 0.002 |
| 671.439 | 0.002 |
| 671.636 | 0.002 |
| 671.832 | 0.002 |
| 672.029 | 0.002 |
| 672.225 | 0.002 |
| 672.421 | 0.002 |
| 672.618 | 0.002 |
| 672.814 | 0.002 |
| 673.01 | 0.002 |
| 673.207 | 0.002 |
| 673.403 | 0.002 |
| 673.599 | 0.002 |
| 673.795 | 0.002 |
| 673.992 | 0.002 |
| 674.188 | 0.002 |
| 674.384 | 0.002 |
| 674.58 | 0.002 |
| 674.776 | 0.002 |
| 674.973 | 0.002 |
| 675.169 | 0.002 |
| 675.365 | 0.002 |
| 675.561 | 0.002 |
| 675.757 | 0.002 |
| 675.953 | 0.002 |
| 676.149 | 0.001 |
| 676.345 | 0.001 |
| 676.541 | 0.002 |
| 676.737 | 0.002 |
| 676.933 | 0.001 |
| 677.129 | 0.001 |
| 677.325 | 0.001 |
| 677.521 | 0.001 |
| 677.717 | 0.001 |
| 677.913 | 0.001 |
| 678.109 | 0.001 |
| 678.305 | 0.001 |
| 678.501 | 0.001 |
| 678.697 | 0.001 |
| 678.893 | 0.001 |
| 679.089 | 0.001 |
| 679.284 | 0.001 |
| 679.48 | 0.001 |
| 679.676 | 0.001 |
| 679.872 | 0.001 |
| 680.068 | 0.001 |
| 680.263 | 0.001 |
| 680.459 | 0.001 |
| 680.655 | 0.001 |
| 680.851 | 0.001 |
| 681.046 | 0.001 |
| 681.242 | 0.001 |
| 681.438 | 0.001 |
| 681.633 | 0.001 |
| 681.829 | 0.001 |
| 682.025 | 0.001 |
| 682.22 | 0.001 |
| 682.416 | 0.001 |
| 682.611 | 0.001 |
| 682.807 | 0.001 |
| 683.002 | 0.001 |
| 683.198 | 0.001 |
| 683.394 | 0.001 |
| 683.589 | 0.001 |
| 683.785 | 0.001 |
| 683.98 | 0.001 |
| 684.176 | 0.001 |
| 684.371 | 0.001 |
| 684.566 | 0.001 |
| 684.762 | 0.001 |
| 684.957 | 0.001 |
| 685.153 | 0.001 |
| 685.348 | 0.001 |
| 685.543 | 0.001 |
| 685.739 | 0.001 |
| 685.934 | 0.001 |
| 686.129 | 0.001 |
| 686.325 | 0.001 |
| 686.52 | 0.001 |
| 686.715 | 0.001 |
| 686.911 | 0.001 |
| 687.106 | 0.001 |
| 687.301 | 0.001 |
| 687.496 | 0.001 |
| 687.691 | 0.001 |
| 687.887 | 0.001 |
| 688.082 | 0.001 |
| 688.277 | 0.001 |
| 688.472 | 0.001 |
| 688.667 | 0.001 |
| 688.862 | 0.001 |
| 689.057 | 0.001 |
| 689.253 | 0.001 |
| 689.448 | 0.001 |
| 689.643 | 0.001 |
| 689.838 | 0.001 |
| 690.033 | 0.001 |
| 690.228 | 0.001 |
| 690.423 | 0.001 |
| 690.618 | 0.001 |
| 690.813 | 0.001 |
| 691.008 | 0.001 |
| 691.203 | 0.001 |
| 691.398 | 0.001 |
| 691.592 | 0.001 |
| 691.787 | 0.001 |
| 691.982 | 0 |
| 692.177 | 0 |
| 692.372 | 0.001 |
| 692.567 | 0.001 |
| 692.762 | 0.001 |
| 692.956 | 0.001 |
| 693.151 | 0.001 |
| 693.346 | 0.001 |
| 693.541 | 0 |
| 693.735 | 0.001 |
| 693.93 | 0.001 |
| 694.125 | 0.001 |
| 694.32 | 0.001 |
| 694.514 | 0.001 |
| 694.709 | 0.001 |
| 694.904 | 0.001 |
| 695.098 | 0.001 |
| 695.293 | 0.001 |
| 695.487 | 0.001 |
| 695.682 | 0 |
| 695.877 | 0 |
| 696.071 | 0 |
| 696.266 | 0 |
| 696.46 | 0 |
| 696.655 | 0.001 |
| 696.849 | 0 |
| 697.044 | 0 |
| 697.238 | 0 |
| 697.433 | 0 |
| 697.627 | 0 |
| 697.822 | 0 |
| 698.016 | 0 |
| 698.21 | 0.001 |
| 698.405 | 0 |
| 698.599 | 0.001 |
| 698.793 | 0 |
| 698.988 | 0 |
| 699.182 | 0.001 |
| 699.376 | 0 |
| 699.571 | 0 |
| 699.765 | 0 |
| 699.959 | 0 |
| 700.154 | 0 |
| 700.348 | 0 |
| 700.542 | 0 |
| 700.736 | 0 |
| 700.93 | 0 |
| 701.125 | 0 |
| 701.319 | 0 |
| 701.513 | 0 |
| 701.707 | 0 |
| 701.901 | 0.001 |
| 702.095 | 0 |
| 702.289 | 0.001 |
| 702.483 | 0 |
| 702.677 | 0.001 |
| 702.871 | 0 |
| 703.065 | 0 |
| 703.259 | 0 |
| 703.453 | 0 |
| 703.647 | 0 |
| 703.841 | 0 |
| 704.035 | 0 |
| 704.229 | 0 |
| 704.423 | 0 |
| 704.617 | 0 |
| 704.811 | 0 |
| 705.005 | 0 |
| 705.199 | 0.001 |
| 705.392 | 0 |
| 705.586 | 0 |
| 705.78 | 0 |
| 705.974 | 0.001 |
| 706.168 | 0.001 |
| 706.361 | 0 |
| 706.555 | 0 |
| 706.749 | 0 |
| 706.943 | 0 |
| 707.136 | 0 |
| 707.33 | 0 |
| 707.524 | 0 |
| 707.717 | 0 |
| 707.911 | 0 |
| 708.105 | 0 |
| 708.298 | 0 |
| 708.492 | 0 |
| 708.685 | 0 |
| 708.879 | 0 |
| 709.073 | 0 |
| 709.266 | 0 |
| 709.46 | 0 |
| 709.653 | 0 |
| 709.847 | 0 |
| 710.04 | 0 |
| 710.234 | 0 |
| 710.427 | 0 |
| 710.62 | 0 |
| 710.814 | 0 |
| 711.007 | 0 |
| 711.201 | 0 |
| 711.394 | 0 |
| 711.587 | 0 |
| 711.781 | 0 |
| 711.974 | 0 |
| 712.167 | 0 |
| 712.361 | 0 |
| 712.554 | 0 |
| 712.747 | 0 |
| 712.94 | 0 |
| 713.134 | 0 |
| 713.327 | 0 |
| 713.52 | 0 |
| 713.713 | 0 |
| 713.906 | 0 |
| 714.1 | 0 |
| 714.293 | 0 |
| 714.486 | 0 |
| 714.679 | 0 |
| 714.872 | 0 |
| 715.065 | 0 |
| 715.258 | 0 |
| 715.451 | 0 |
| 715.644 | 0 |
| 715.837 | 0 |
| 716.03 | 0 |
| 716.223 | 0 |
| 716.416 | 0 |
| 716.609 | 0 |
| 716.802 | 0 |
| 716.995 | 0 |
| 717.188 | 0 |
| 717.381 | 0 |
| 717.574 | 0 |
| 717.766 | 0 |
| 717.959 | 0 |
| 718.152 | 0 |
| 718.345 | 0 |
| 718.538 | 0 |
| 718.731 | 0 |
| 718.923 | 0 |
| 719.116 | 0 |
| 719.309 | 0 |
| 719.502 | 0 |
| 719.694 | 0 |
| 719.887 | 0 |
| 720.08 | 0 |
| 720.272 | 0 |
| 720.465 | 0 |
| 720.658 | 0 |
| 720.85 | 0 |
| 721.043 | 0 |
| 721.235 | 0 |
| 721.428 | 0 |
| 721.62 | 0 |
| 721.813 | 0 |
| 722.006 | 0 |
| 722.198 | 0 |
| 722.391 | 0 |
| 722.583 | 0 |
| 722.775 | 0 |
| 722.968 | 0 |
| 723.16 | 0 |
| 723.353 | 0 |
| 723.545 | 0 |
| 723.738 | 0 |
| 723.93 | 0 |
| 724.122 | 0 |
| 724.315 | 0 |
| 724.507 | 0 |
| 724.699 | 0 |
| 724.891 | 0 |
| 725.084 | 0 |
| 725.276 | 0 |
| 725.468 | 0 |
| 725.66 | 0 |
| 725.853 | 0 |
| 726.045 | 0 |
| 726.237 | 0 |
| 726.429 | 0 |
| 726.621 | 0 |
| 726.814 | 0 |
| 727.006 | 0 |
| 727.198 | 0 |
| 727.39 | 0 |
| 727.582 | 0 |
| 727.774 | 0 |
| 727.966 | 0 |
| 728.158 | 0 |
| 728.35 | 0 |
| 728.542 | 0 |
| 728.734 | 0 |
| 728.926 | 0 |
| 729.118 | 0 |
| 729.31 | 0 |
| 729.502 | 0 |
| 729.694 | 0 |
| 729.886 | 0 |
| 730.077 | 0 |
| 730.269 | 0 |
| 730.461 | 0 |
| 730.653 | 0 |
| 730.845 | 0 |
| 731.036 | 0 |
| 731.228 | 0 |
| 731.42 | 0 |
| 731.612 | 0 |
| 731.803 | 0 |
| 731.995 | 0 |
| 732.187 | 0 |
| 732.379 | 0 |
| 732.57 | 0 |
| 732.762 | 0 |
| 732.953 | 0 |
| 733.145 | 0 |
| 733.337 | 0 |
| 733.528 | 0 |
| 733.72 | 0 |
| 733.911 | 0 |
| 734.103 | 0 |
| 734.294 | 0 |
| 734.486 | 0 |
| 734.677 | 0 |
| 734.869 | 0 |
| 735.06 | 0 |
| 735.252 | 0 |
| 735.443 | 0 |
| 735.635 | 0 |
| 735.826 | 0 |
| 736.017 | 0 |
| 736.209 | 0 |
| 736.4 | 0 |
| 736.592 | 0 |
| 736.783 | 0 |
| 736.974 | 0 |
| 737.165 | 0 |
| 737.357 | 0 |
| 737.548 | 0 |
| 737.739 | 0 |
| 737.93 | 0 |
| 738.122 | 0 |
| 738.313 | 0 |
| 738.504 | 0 |
| 738.695 | 0 |
| 738.886 | 0 |
| 739.077 | 0 |
| 739.269 | 0 |
| 739.46 | 0 |
| 739.651 | 0 |
| 739.842 | 0 |
| 740.033 | 0 |
| 740.224 | 0 |
| 740.415 | 0 |
| 740.606 | 0 |
| 740.797 | 0 |
| 740.988 | 0 |
| 741.179 | 0 |
| 741.37 | 0 |
| 741.561 | 0 |
| 741.752 | 0 |
| 741.942 | 0 |
| 742.133 | 0 |
| 742.324 | 0 |
| 742.515 | 0 |
| 742.706 | 0 |
| 742.897 | 0 |
| 743.087 | 0 |
| 743.278 | 0 |
| 743.469 | 0 |
| 743.66 | 0 |
| 743.85 | 0 |
| 744.041 | 0 |
| 744.232 | 0 |
| 744.423 | 0 |
| 744.613 | 0 |
| 744.804 | 0 |
| 744.994 | 0 |
| 745.185 | 0 |
| 745.376 | 0 |
| 745.566 | 0 |
| 745.757 | 0.001 |
| 745.947 | 0 |
| 746.138 | 0 |
| 746.328 | 0 |
| 746.519 | 0 |
| 746.709 | 0 |
| 746.9 | 0 |
| 747.09 | 0 |
| 747.281 | 0 |
| 747.471 | 0 |
| 747.662 | 0 |
| 747.852 | 0 |
| 748.042 | 0 |
| 748.233 | 0 |
| 748.423 | 0 |
| 748.613 | 0 |
| 748.804 | 0 |
| 748.994 | 0 |
| 749.184 | 0 |
| 749.375 | 0 |
| 749.565 | 0 |
| 749.755 | 0 |
| 749.945 | 0 |
| 750.136 | 0 |
| 750.326 | 0 |
| 750.516 | 0 |
| 750.706 | 0 |
| 750.896 | 0 |
| 751.086 | 0 |
| 751.276 | 0 |
| 751.467 | 0 |
| 751.657 | 0 |
| 751.847 | 0 |
| 752.037 | 0 |
| 752.227 | 0 |
| 752.417 | 0 |
| 752.607 | 0 |
| 752.797 | 0 |
| 752.987 | 0 |
| 753.177 | 0 |
| 753.367 | 0 |
| 753.556 | 0 |
| 753.746 | 0 |
| 753.936 | 0 |
| 754.126 | 0 |
| 754.316 | 0 |
| 754.506 | 0 |
| 754.696 | 0 |
| 754.885 | 0 |
| 755.075 | 0 |
| 755.265 | 0 |
| 755.455 | 0 |
| 755.644 | 0 |
| 755.834 | 0 |
| 756.024 | 0 |
| 756.214 | 0 |
| 756.403 | 0 |
| 756.593 | 0 |
| 756.782 | 0 |
| 756.972 | 0 |
| 757.162 | 0 |
| 757.351 | 0 |
| 757.541 | 0 |
| 757.73 | 0 |
| 757.92 | 0 |
| 758.109 | 0 |
| 758.299 | 0 |
| 758.488 | 0 |
| 758.678 | 0 |
| 758.867 | 0 |
| 759.057 | 0 |
| 759.246 | 0 |
| 759.436 | 0 |
| 759.625 | 0 |
| 759.814 | 0 |
| 760.004 | 0 |
| 760.193 | 0 |
| 760.383 | 0 |
| 760.572 | 0 |
| 760.761 | 0 |
| 760.95 | 0 |
| 761.14 | 0 |
| 761.329 | 0 |
| 761.518 | 0 |
| 761.707 | 0 |
| 761.897 | 0 |
| 762.086 | 0 |
| 762.275 | 0 |
| 762.464 | 0 |
| 762.653 | 0 |
| 762.842 | 0 |
| 763.031 | 0 |
| 763.221 | 0 |
| 763.41 | 0 |
| 763.599 | 0 |
| 763.788 | 0 |
| 763.977 | 0 |
| 764.166 | 0 |
| 764.355 | 0 |
| 764.544 | 0 |
| 764.733 | 0 |
| 764.922 | 0 |
| 765.11 | 0 |
| 765.299 | 0 |
| 765.488 | 0 |
| 765.677 | 0 |
| 765.866 | 0 |
| 766.055 | 0 |
| 766.244 | 0 |
| 766.432 | 0 |
| 766.621 | 0 |
| 766.81 | 0 |
| 766.999 | 0 |
| 767.188 | 0 |
| 767.376 | 0 |
| 767.565 | 0 |
| 767.754 | 0 |
| 767.942 | 0 |
| 768.131 | 0 |
| 768.32 | 0 |
| 768.508 | 0 |
| 768.697 | 0 |
| 768.885 | 0 |
| 769.074 | 0 |
| 769.263 | 0 |
| 769.451 | 0 |
| 769.64 | 0 |
| 769.828 | 0 |
| 770.017 | 0 |
| 770.205 | 0 |
| 770.394 | 0 |
| 770.582 | 0 |
| 770.771 | 0 |
| 770.959 | 0 |
| 771.147 | 0 |
| 771.336 | 0 |
| 771.524 | 0 |
| 771.712 | 0 |
| 771.901 | 0 |
| 772.089 | 0 |
| 772.277 | 0 |
| 772.466 | 0 |
| 772.654 | 0 |
| 772.842 | 0 |
| 773.03 | 0 |
| 773.219 | 0 |
| 773.407 | 0 |
| 773.595 | 0 |
| 773.783 | 0 |
| 773.971 | 0 |
| 774.159 | 0 |
| 774.348 | 0 |
| 774.536 | 0 |
| 774.724 | 0 |
| 774.912 | 0 |
| 775.1 | 0 |
| 775.288 | 0 |
| 775.476 | 0 |
| 775.664 | 0 |
| 775.852 | 0 |
| 776.04 | 0 |
| 776.228 | 0 |
| 776.416 | 0 |
| 776.604 | 0 |
| 776.792 | 0 |
| 776.979 | 0 |
| 777.167 | 0 |
| 777.355 | 0 |
| 777.543 | 0 |
| 777.731 | 0 |
| 777.919 | 0 |
| 778.106 | 0 |
| 778.294 | 0 |
| 778.482 | 0 |
| 778.67 | 0 |
| 778.857 | 0 |
| 779.045 | 0 |
| 779.233 | 0 |
| 779.42 | 0 |
| 779.608 | 0 |
| 779.796 | 0 |
| 779.983 | 0 |
| 780.171 | 0 |
| 780.359 | 0 |
| 780.546 | 0 |
| 780.734 | 0 |
| 780.921 | 0 |
| 781.109 | 0 |
| 781.296 | 0 |
| 781.484 | 0 |
| 781.671 | 0 |
| 781.859 | 0 |
| 782.046 | 0 |
| 782.233 | 0 |
| 782.421 | 0 |
| 782.608 | 0 |
| 782.796 | 0 |
| 782.983 | 0 |
| 783.17 | 0 |
| 783.358 | 0 |
| 783.545 | 0 |
| 783.732 | 0 |
| 783.92 | 0 |
| 784.107 | 0 |
| 784.294 | 0 |
| 784.481 | 0 |
| 784.668 | 0 |
| 784.856 | 0 |
| 785.043 | 0 |
| 785.23 | 0 |
| 785.417 | 0 |
| 785.604 | 0 |
| 785.791 | 0 |
| 785.978 | 0 |
| 786.165 | 0 |
| 786.352 | 0 |
| 786.54 | 0 |
| 786.727 | 0 |
| 786.914 | 0 |
| 787.101 | 0 |
| 787.287 | 0 |
| 787.474 | 0 |
| 787.661 | 0 |
| 787.848 | 0 |
| 788.035 | 0 |
| 788.222 | 0 |
| 788.409 | 0 |
| 788.596 | 0 |
| 788.783 | 0 |
| 788.969 | 0 |
| 789.156 | 0 |
| 789.343 | 0 |
| 789.53 | 0 |
| 789.717 | 0 |
| 789.903 | 0 |
| 790.09 | 0 |
| 790.277 | 0 |
| 790.463 | 0 |
| 790.65 | 0 |
| 790.837 | 0 |
| 791.023 | 0 |
| 791.21 | 0 |
| 791.396 | 0 |
| 791.583 | 0 |
| 791.77 | -0.001 |
| 791.956 | -0.001 |
| 792.143 | 0 |
| 792.329 | 0 |
| 792.516 | 0 |
| 792.702 | 0 |
| 792.889 | 0 |
| 793.075 | 0 |
| 793.262 | 0 |
| 793.448 | 0 |
| 793.634 | 0 |
| 793.821 | 0 |
| 794.007 | 0 |
| 794.193 | 0 |
| 794.38 | 0 |
| 794.566 | 0 |
| 794.752 | 0 |
| 794.939 | 0 |
| 795.125 | 0 |
| 795.311 | 0 |
| 795.497 | 0 |
| 795.684 | 0 |
| 795.87 | 0 |
| 796.056 | 0 |
| 796.242 | 0 |
| 796.428 | 0 |
| 796.614 | 0 |
| 796.8 | 0 |
| 796.986 | 0 |
| 797.173 | 0 |
| 797.359 | 0 |
| 797.545 | 0 |
| 797.731 | 0 |
| 797.917 | 0 |
| 798.103 | 0 |
| 798.289 | 0 |
| 798.475 | 0 |
| 798.661 | 0 |
| 798.846 | 0 |
| 799.032 | 0 |
| 799.218 | 0 |
| 799.404 | 0 |
| 799.59 | 0 |
| 799.776 | 0 |
| 799.962 | 0 |
| 800.147 | 0 |
| 800.333 | 0 |
| 800.519 | 0 |
| 800.705 | 0 |
| 800.89 | 0 |
| 801.076 | 0 |
| 801.262 | 0 |
| 801.447 | 0 |
| 801.633 | 0 |
| 801.819 | 0 |
| 802.004 | 0 |
| 802.19 | 0 |
| 802.376 | 0 |
| 802.561 | 0 |
| 802.747 | 0 |
| 802.932 | 0 |
| 803.118 | 0 |
| 803.303 | 0 |
| 803.489 | 0 |
| 803.674 | 0 |
| 803.86 | 0 |
| 804.045 | 0 |
| 804.231 | 0 |
| 804.416 | 0 |
| 804.601 | 0 |
| 804.787 | 0 |
| 804.972 | 0 |
| 805.157 | 0 |
| 805.343 | 0 |
| 805.528 | 0 |
| 805.713 | 0 |
| 805.899 | 0 |
| 806.084 | 0 |
| 806.269 | 0 |
| 806.454 | 0 |
| 806.64 | 0 |
| 806.825 | 0 |
| 807.01 | 0 |
| 807.195 | 0 |
| 807.38 | 0 |
| 807.565 | 0 |
| 807.75 | 0 |
| 807.935 | 0 |
| 808.121 | 0 |
| 808.306 | 0 |
| 808.491 | 0 |
| 808.676 | 0 |
| 808.861 | 0 |
| 809.046 | 0 |
| 809.231 | 0 |
| 809.415 | -0.001 |
| 809.6 | -0.001 |
| 809.785 | -0.001 |
| 809.97 | -0.001 |
| 810.155 | 0 |
| 810.34 | 0 |
| 810.525 | 0 |
| 810.71 | 0 |
| 810.894 | 0 |
| 811.079 | 0 |
| 811.264 | 0 |
| 811.449 | 0 |
| 811.633 | 0 |
| 811.818 | 0 |
| 812.003 | 0 |
| 812.187 | 0 |
| 812.372 | 0 |
| 812.557 | 0 |
| 812.741 | 0 |
| 812.926 | 0 |
| 813.111 | 0 |
| 813.295 | 0 |
| 813.48 | 0 |
| 813.664 | 0 |
| 813.849 | 0 |
| 814.033 | 0 |
| 814.218 | 0 |
| 814.402 | 0 |
| 814.587 | 0 |
| 814.771 | 0 |
| 814.956 | 0 |
| 815.14 | 0 |
| 815.324 | 0 |
| 815.509 | 0 |
| 815.693 | 0 |
| 815.877 | 0 |
| 816.062 | 0 |
| 816.246 | 0 |
| 816.43 | 0 |
| 816.615 | 0.001 |
| 816.799 | 0 |
| 816.983 | 0 |
| 817.167 | 0 |
| 817.352 | 0 |
| 817.536 | 0 |
| 817.72 | 0 |
| 817.904 | 0 |
| 818.088 | 0 |
| 818.272 | 0 |
| 818.456 | 0 |
| 818.64 | 0 |
| 818.824 | -0.001 |
| 819.008 | -0.001 |
| 819.193 | 0 |
| 819.377 | 0 |
| 819.561 | 0 |
| 819.744 | 0 |
| 819.928 | 0 |
| 820.112 | 0 |
| 820.296 | 0 |
| 820.48 | 0 |
| 820.664 | 0 |
| 820.848 | 0 |
| 821.032 | 0 |
| 821.216 | 0 |
| 821.399 | 0 |
| 821.583 | 0 |
| 821.767 | 0 |
| 821.951 | 0 |
| 822.134 | -0.001 |
| 822.318 | -0.001 |
| 822.502 | 0 |
| 822.686 | 0 |
| 822.869 | 0 |
| 823.053 | -0.001 |
| 823.237 | 0 |
| 823.42 | 0 |
| 823.604 | 0 |
| 823.787 | 0 |
| 823.971 | 0 |
| 824.154 | -0.001 |
| 824.338 | 0 |
| 824.522 | 0 |
| 824.705 | 0 |
| 824.888 | 0 |
| 825.072 | 0 |
| 825.255 | 0 |
| 825.439 | 0 |
| 825.622 | 0 |
| 825.806 | 0 |
| 825.989 | 0 |
| 826.172 | 0 |
| 826.356 | 0 |
| 826.539 | 0 |
| 826.722 | 0 |
| 826.906 | 0 |
| 827.089 | 0 |
| 827.272 | 0 |
| 827.455 | 0 |
| 827.639 | 0 |
| 827.822 | 0 |
| 828.005 | 0 |
| 828.188 | 0 |
| 828.371 | 0 |
| 828.554 | 0 |
| 828.737 | -0.001 |
| 828.921 | 0 |
| 829.104 | 0 |
| 829.287 | 0 |
| 829.47 | 0 |
| 829.653 | 0 |
| 829.836 | 0 |
| 830.019 | 0 |
| 830.202 | 0 |
| 830.385 | 0 |
| 830.568 | 0 |
| 830.75 | 0 |
| 830.933 | 0 |
| 831.116 | 0 |
| 831.299 | 0 |
| 831.482 | 0 |
| 831.665 | 0 |
| 831.848 | 0 |
| 832.03 | 0 |
| 832.213 | 0 |
| 832.396 | -0.001 |
| 832.579 | -0.001 |
| 832.761 | -0.001 |
| 832.944 | 0 |
| 833.127 | 0 |
| 833.309 | 0 |
| 833.492 | 0 |
| 833.675 | 0 |
| 833.857 | 0 |
| 834.04 | 0 |
| 834.222 | 0 |
| 834.405 | 0 |
| 834.588 | 0 |
| 834.77 | 0 |
| 834.953 | 0 |
| 835.135 | 0 |
| 835.318 | 0 |
| 835.5 | 0 |
| 835.682 | -0.001 |
| 835.865 | 0 |
| 836.047 | 0 |
| 836.23 | 0 |
| 836.412 | 0 |
| 836.594 | -0.001 |
| 836.777 | -0.001 |
| 836.959 | 0 |
| 837.141 | 0 |
| 837.324 | -0.001 |
| 837.506 | -0.001 |
| 837.688 | -0.001 |
| 837.87 | -0.001 |
| 838.052 | 0 |
| 838.235 | 0 |
| 838.417 | 0 |
| 838.599 | 0 |
| 838.781 | 0 |
| 838.963 | 0 |
| 839.145 | 0 |
| 839.327 | 0 |
| 839.509 | 0 |
| 839.691 | -0.001 |
| 839.874 | -0.001 |
| 840.056 | -0.001 |
| 840.238 | -0.001 |
| 840.419 | 0 |
| 840.601 | 0 |
| 840.783 | 0 |
| 840.965 | 0 |
| 841.147 | 0 |
| 841.329 | 0 |
| 841.511 | -0.001 |
| 841.693 | 0 |
| 841.875 | 0 |
| 842.056 | 0 |
| 842.238 | 0 |
| 842.42 | 0 |
| 842.602 | 0 |
| 842.783 | 0 |
| 842.965 | 0 |
| 843.147 | 0 |
| 843.329 | -0.001 |
| 843.51 | -0.001 |
| 843.692 | -0.001 |
| 843.874 | -0.001 |
| 844.055 | -0.001 |
| 844.237 | 0 |
| 844.418 | 0 |
| 844.6 | 0 |
| 844.781 | 0 |
| 844.963 | 0 |
| 845.144 | 0 |
| 845.326 | 0 |
| 845.507 | 0 |
| 845.689 | -0.001 |
| 845.87 | -0.001 |
| 846.052 | -0.001 |
| 846.233 | 0 |
| 846.414 | -0.001 |
| 846.596 | -0.001 |
| 846.777 | -0.001 |
| 846.958 | -0.001 |
| 847.14 | 0 |
| 847.321 | 0 |
| 847.502 | 0 |
| 847.684 | 0 |
| 847.865 | 0 |
| 848.046 | 0 |
| 848.227 | 0 |
| 848.408 | 0 |
| 848.59 | 0 |
| 848.771 | 0 |
| 848.952 | 0 |
| 849.133 | 0 |
| 849.314 | 0 |
| 849.495 | 0 |
| 849.676 | 0 |
| 849.857 | 0 |
| 850.038 | -0.001 |
| 850.219 | 0 |
| 850.4 | -0.001 |
| 850.581 | 0 |
| 850.762 | 0 |
| 850.943 | 0 |
| 851.124 | 0 |
| 851.305 | -0.001 |
| 851.486 | -0.001 |
| 851.667 | 0 |
| 851.847 | 0 |
| 852.028 | 0 |
| 852.209 | -0.001 |
| 852.39 | 0 |
| 852.571 | 0 |
| 852.751 | 0 |
| 852.932 | 0.001 |
| 853.113 | 0 |
| 853.293 | 0.001 |
| 853.474 | 0 |
| 853.655 | 0 |
| 853.835 | -0.001 |
| 854.016 | 0 |
| 854.197 | 0 |
| 854.377 | 0 |
| 854.558 | 0 |
| 854.738 | 0 |
| 854.919 | -0.001 |
| 855.099 | -0.001 |
| 855.28 | 0 |
| 855.46 | 0 |
| 855.641 | 0 |
| 855.821 | 0 |
| 856.002 | 0 |
| 856.182 | 0 |
| 856.362 | 0 |
| 856.543 | 0 |
| 856.723 | 0 |
| 856.903 | 0 |
| 857.084 | 0 |
| 857.264 | 0 |
| 857.444 | 0 |
| 857.625 | 0 |
| 857.805 | 0 |
| 857.985 | 0 |
| 858.165 | 0 |
| 858.345 | 0 |
| 858.526 | 0 |
| 858.706 | 0 |
| 858.886 | -0.001 |
| 859.066 | -0.001 |
| 859.246 | -0.001 |
| 859.426 | -0.001 |
| 859.606 | -0.001 |
| 859.786 | -0.001 |
| 859.966 | 0 |
| 860.146 | 0 |
| 860.326 | -0.001 |
| 860.506 | 0 |
| 860.686 | 0 |
| 860.866 | -0.001 |
| 861.046 | -0.001 |
| 861.226 | -0.001 |
| 861.406 | -0.001 |
| 861.586 | -0.001 |
| 861.765 | -0.001 |
| 861.945 | -0.001 |
| 862.125 | -0.001 |
| 862.305 | -0.002 |
| 862.485 | -0.001 |
| 862.664 | -0.001 |
| 862.844 | 0 |
| 863.024 | 0 |
| 863.203 | 0 |
| 863.383 | 0 |
| 863.563 | 0 |
| 863.742 | 0 |
| 863.922 | 0 |
| 864.102 | 0 |
| 864.281 | 0 |
| 864.461 | 0 |
| 864.64 | -0.001 |
| 864.82 | -0.001 |
| 864.999 | -0.001 |
| 865.179 | 0 |
| 865.358 | 0 |
| 865.538 | -0.001 |
| 865.717 | -0.001 |
| 865.896 | -0.001 |
| 866.076 | 0 |
| 866.255 | 0 |
| 866.435 | 0 |
| 866.614 | 0 |
| 866.793 | 0 |
| 866.973 | -0.001 |
| 867.152 | -0.001 |
| 867.331 | 0 |
| 867.51 | 0 |
| 867.69 | 0 |
| 867.869 | 0 |
| 868.048 | 0 |
| 868.227 | 0 |
| 868.406 | -0.001 |
| 868.585 | -0.001 |
| 868.765 | -0.001 |
| 868.944 | 0 |
| 869.123 | 0 |
| 869.302 | 0 |
| 869.481 | 0 |
| 869.66 | 0 |
| 869.839 | 0 |
| 870.018 | -0.001 |
| 870.197 | -0.001 |
| 870.376 | -0.001 |
| 870.555 | 0 |
| 870.734 | -0.001 |
| 870.912 | 0 |
| 871.091 | -0.001 |
| 871.27 | -0.001 |
| 871.449 | -0.001 |
| 871.628 | 0 |
| 871.807 | 0 |
| 871.985 | -0.001 |
| 872.164 | -0.001 |
| 872.343 | -0.001 |
| 872.522 | -0.001 |
| 872.7 | -0.001 |
| 872.879 | 0 |
| 873.058 | 0 |
| 873.236 | -0.001 |
| 873.415 | -0.001 |
| 873.594 | -0.001 |
| 873.772 | -0.001 |
| 873.951 | 0 |
| 874.129 | 0 |
| 874.308 | 0 |
| 874.486 | -0.001 |
| 874.665 | 0 |
| 874.843 | -0.001 |
| 875.022 | 0 |
| 875.2 | 0 |
| 875.379 | 0 |
| 875.557 | 0 |
| 875.736 | 0 |
| 875.914 | -0.001 |
| 876.092 | 0 |
| 876.271 | 0 |
| 876.449 | 0 |
| 876.627 | -0.001 |
| 876.805 | -0.001 |
| 876.984 | 0 |
| 877.162 | -0.001 |
| 877.34 | -0.001 |
| 877.518 | -0.001 |
| 877.697 | 0 |
| 877.875 | 0.001 |
| 878.053 | 0 |
| 878.231 | 0 |
| 878.409 | 0 |
| 878.587 | 0 |
| 878.765 | -0.001 |
| 878.943 | -0.001 |
| 879.121 | -0.001 |
| 879.299 | 0 |
| 879.477 | 0 |
| 879.655 | 0 |
| 879.833 | 0 |
| 880.011 | -0.001 |
| 880.189 | -0.001 |
| 880.367 | -0.001 |
| 880.545 | -0.001 |
| 880.723 | -0.001 |
| 880.901 | 0 |
| 881.079 | 0 |
| 881.256 | 0 |
| 881.434 | 0 |
| 881.612 | -0.001 |
| 881.79 | -0.001 |
| 881.967 | -0.001 |
| 882.145 | 0 |
| 882.323 | 0.001 |
| 882.501 | 0.001 |
| 882.678 | 0 |
| 882.856 | -0.001 |
| 883.033 | -0.001 |
| 883.211 | -0.001 |
| 883.389 | -0.002 |
| 883.566 | -0.002 |
| 883.744 | -0.002 |
| 883.921 | -0.001 |
| 884.099 | -0.001 |
| 884.276 | 0 |
| 884.454 | 0 |
| 884.631 | -0.001 |
| 884.809 | -0.002 |
| 884.986 | -0.002 |
| 885.163 | -0.001 |
| 885.341 | 0 |
| 885.518 | 0 |
| 885.696 | -0.001 |
| 885.873 | -0.001 |
| 886.05 | -0.001 |
| 886.227 | 0 |
| 886.405 | 0 |
| 886.582 | 0 |
| 886.759 | 0 |
| 886.936 | -0.001 |
| 887.114 | -0.001 |
| 887.291 | -0.001 |
| 887.468 | 0 |
| 887.645 | 0 |
| 887.822 | 0 |
| 887.999 | 0 |
| 888.176 | -0.001 |
| 888.353 | -0.001 |
| 888.53 | -0.001 |
| 888.707 | -0.001 |
| 888.884 | -0.001 |
| 889.061 | -0.001 |
| 889.238 | -0.001 |
| 889.415 | 0 |
| 889.592 | 0 |
| 889.769 | 0 |
| 889.946 | 0 |
| 890.123 | -0.001 |
| 890.3 | 0 |
| 890.477 | 0 |
| 890.653 | 0 |
| 890.83 | 0 |
| 891.007 | 0 |
| 891.184 | 0 |
| 891.36 | -0.001 |
| 891.537 | -0.001 |
| 891.714 | -0.001 |
| 891.891 | 0 |
| 892.067 | 0 |
| 892.244 | -0.001 |
| 892.421 | 0 |
| 892.597 | 0 |
| 892.774 | 0 |
| 892.95 | 0 |
| 893.127 | 0 |
| 893.303 | 0 |
| 893.48 | -0.001 |
| 893.656 | 0 |
| 893.833 | 0 |
| 894.009 | 0 |
| 894.186 | -0.001 |
| 894.362 | -0.001 |
| 894.538 | 0 |
| 894.715 | 0.001 |
| 894.891 | 0.001 |
| 895.068 | 0 |
| 895.244 | 0 |
| 895.42 | 0 |
| 895.596 | -0.001 |
| 895.773 | -0.001 |
| 895.949 | 0 |
| 896.125 | 0 |
| 896.301 | 0 |
| 896.478 | -0.001 |
| 896.654 | 0 |
| 896.83 | -0.001 |
| 897.006 | 0 |
| 897.182 | 0 |
| 897.358 | 0 |
| 897.534 | 0 |
| 897.71 | 0 |
| 897.886 | -0.001 |
| 898.062 | -0.001 |
| 898.238 | 0 |
| 898.414 | 0.001 |
| 898.59 | 0.001 |
| 898.766 | 0 |
| 898.942 | -0.001 |
| 899.118 | -0.002 |
| 899.294 | -0.001 |
| 899.47 | -0.001 |
| 899.646 | 0 |
| 899.821 | 0 |
| 899.997 | 0 |
| 900.173 | -0.001 |
| 900.349 | -0.001 |
| 900.525 | -0.001 |
| 900.7 | -0.001 |
| 900.876 | 0 |
| 901.052 | 0 |
| 901.227 | 0.001 |
| 901.403 | 0 |
| 901.579 | 0 |
| 901.754 | -0.001 |
| 901.93 | -0.001 |
| 902.105 | -0.001 |
| 902.281 | -0.001 |
| 902.456 | 0 |
| 902.632 | 0 |
| 902.807 | -0.001 |
| 902.983 | 0 |
| 903.158 | 0 |
| 903.334 | 0 |
| 903.509 | -0.001 |
| 903.685 | -0.001 |
| 903.86 | -0.001 |
| 904.035 | -0.001 |
| 904.211 | -0.001 |
| 904.386 | -0.001 |
| 904.561 | -0.001 |
| 904.737 | -0.001 |
| 904.912 | -0.001 |
| 905.087 | -0.001 |
| 905.262 | 0 |
| 905.438 | 0 |
| 905.613 | 0 |
| 905.788 | 0 |
| 905.963 | 0 |
| 906.138 | -0.001 |
| 906.313 | -0.001 |
| 906.488 | -0.002 |
| 906.663 | -0.001 |
| 906.839 | -0.001 |
| 907.014 | -0.001 |
| 907.189 | -0.001 |
| 907.364 | -0.001 |
| 907.539 | -0.002 |
| 907.714 | -0.001 |
| 907.888 | -0.001 |
| 908.063 | 0 |
| 908.238 | 0 |
| 908.413 | -0.001 |
| 908.588 | 0 |
| 908.763 | -0.002 |
| 908.938 | -0.001 |
| 909.112 | 0 |
| 909.287 | 0.001 |
| 909.462 | 0 |
| 909.637 | -0.001 |
| 909.811 | -0.001 |
| 909.986 | 0 |
| 910.161 | 0 |
| 910.336 | -0.001 |
| 910.51 | -0.001 |
| 910.685 | -0.001 |
| 910.859 | -0.001 |
| 911.034 | -0.001 |
| 911.209 | -0.002 |
| 911.383 | -0.002 |
| 911.558 | -0.001 |
| 911.732 | -0.001 |
| 911.907 | -0.001 |
| 912.081 | -0.001 |
| 912.256 | 0 |
| 912.43 | 0 |
| 912.604 | 0 |
| 912.779 | 0 |
| 912.953 | 0 |
| 913.128 | -0.001 |
| 913.302 | -0.002 |
| 913.476 | -0.001 |
| 913.65 | -0.002 |
| 913.825 | 0 |
| 913.999 | 0 |
| 914.173 | 0 |
| 914.347 | -0.001 |
| 914.522 | -0.001 |
| 914.696 | 0 |
| 914.87 | 0 |
| 915.044 | 0 |
| 915.218 | -0.001 |
| 915.392 | -0.001 |
| 915.566 | -0.001 |
| 915.741 | -0.001 |
| 915.915 | -0.001 |
| 916.089 | -0.001 |
| 916.263 | -0.002 |
| 916.437 | -0.002 |
| 916.611 | -0.001 |
| 916.784 | -0.001 |
| 916.958 | -0.001 |
| 917.132 | -0.001 |
| 917.306 | -0.001 |
| 917.48 | -0.001 |
| 917.654 | -0.001 |
| 917.828 | -0.001 |
| 918.002 | -0.002 |
| 918.175 | -0.001 |
| 918.349 | 0 |
| 918.523 | 0 |
| 918.697 | 0.001 |
| 918.87 | 0 |
| 919.044 | 0 |
| 919.218 | 0 |
| 919.391 | -0.001 |
| 919.565 | -0.002 |
| 919.739 | -0.002 |
| 919.912 | -0.001 |
| 920.086 | 0 |
| 920.259 | 0 |
| 920.433 | -0.002 |
| 920.606 | -0.001 |
| 920.78 | -0.001 |
| 920.953 | 0 |
| 921.127 | -0.001 |
| 921.3 | -0.001 |
| 921.474 | -0.002 |
| 921.647 | -0.002 |
| 921.82 | -0.002 |
| 921.994 | -0.001 |
| 922.167 | -0.001 |
| 922.34 | -0.001 |
| 922.514 | 0 |
| 922.687 | -0.001 |
| 922.86 | -0.002 |
| 923.033 | -0.002 |
| 923.207 | -0.002 |
| 923.38 | -0.002 |
| 923.553 | -0.002 |
| 923.726 | -0.002 |
| 923.899 | -0.002 |
| 924.072 | -0.002 |
| 924.246 | -0.002 |
| 924.419 | -0.003 |
| 924.592 | -0.002 |
| 924.765 | -0.002 |
| 924.938 | -0.002 |
| 925.111 | -0.003 |
| 925.284 | -0.002 |
| 925.457 | 0 |
| 925.63 | 0.001 |
| 925.803 | 0 |
| 925.976 | -0.001 |
| 926.148 | -0.002 |
| 926.321 | -0.002 |
| 926.494 | -0.003 |
| 926.667 | -0.004 |
| 926.84 | -0.003 |
| 927.013 | -0.001 |
| 927.185 | -0.001 |
| 927.358 | -0.001 |
| 927.531 | -0.001 |
| 927.704 | -0.001 |
| 927.876 | 0 |
| 928.049 | 0 |
| 928.222 | 0 |
| 928.394 | 0 |
| 928.567 | -0.001 |
| 928.739 | -0.001 |
| 928.912 | -0.002 |
| 929.084 | -0.002 |
| 929.257 | -0.002 |
| 929.43 | -0.001 |
| 929.602 | -0.001 |
| 929.774 | -0.001 |
| 929.947 | -0.002 |
| 930.119 | -0.002 |
| 930.292 | -0.002 |
| 930.464 | -0.002 |
| 930.637 | -0.002 |
| 930.809 | -0.002 |
| 930.981 | -0.001 |
| 931.154 | 0 |
| 931.326 | 0 |
| 931.498 | -0.001 |
| 931.67 | -0.002 |
| 931.843 | -0.001 |
| 932.015 | -0.002 |
| 932.187 | -0.001 |
| 932.359 | -0.001 |
| 932.531 | -0.001 |
| 932.703 | -0.001 |
| 932.876 | -0.002 |
| 933.048 | -0.002 |
| 933.22 | -0.002 |
| 933.392 | -0.001 |
| 933.564 | -0.001 |
| 933.736 | 0 |
| 933.908 | -0.002 |
| 934.08 | -0.002 |
| 934.252 | -0.002 |
| 934.424 | -0.001 |
| 934.596 | -0.001 |
| 934.767 | -0.001 |
| 934.939 | -0.001 |
| 935.111 | 0 |
| 935.283 | 0 |
| 935.455 | -0.001 |
| 935.627 | -0.002 |
| 935.798 | -0.002 |
| 935.97 | -0.003 |
| 936.142 | -0.002 |
| 936.314 | -0.003 |
| 936.485 | -0.002 |
| 936.657 | -0.001 |
| 936.829 | 0.001 |
| 937.0 | 0 |
| 937.172 | -0.001 |
| 937.344 | -0.002 |
| 937.515 | -0.001 |
| 937.687 | -0.002 |
| 937.858 | -0.002 |
| 938.03 | -0.001 |
| 938.201 | -0.002 |
| 938.373 | -0.002 |
| 938.544 | -0.003 |
| 938.716 | -0.002 |
| 938.887 | -0.003 |
| 939.058 | -0.002 |
| 939.23 | -0.003 |
| 939.401 | -0.001 |
| 939.572 | -0.002 |
| 939.744 | -0.002 |
| 939.915 | -0.001 |
| 940.086 | -0.001 |
| 940.258 | -0.001 |
| 940.429 | 0 |
| 940.6 | 0 |
| 940.771 | 0 |
| 940.942 | -0.002 |
| 941.114 | -0.002 |
| 941.285 | -0.002 |
| 941.456 | -0.001 |
| 941.627 | -0.001 |
| 941.798 | 0 |
| 941.969 | -0.001 |
| 942.14 | 0 |
| 942.311 | 0 |
| 942.482 | 0.001 |
| 942.653 | 0 |
| 942.824 | 0.001 |
| 942.995 | -0.002 |
| 943.166 | -0.001 |
| 943.337 | -0.004 |
| 943.508 | -0.003 |
| 943.678 | -0.004 |
| 943.849 | -0.004 |
| 944.02 | -0.002 |
| 944.191 | 0 |
| 944.362 | -0.001 |
| 944.532 | 0 |
| 944.703 | -0.001 |
| 944.874 | 0.001 |
| 945.045 | 0 |
| 945.215 | -0.001 |
| 945.386 | -0.001 |
| 945.557 | -0.001 |
| 945.727 | -0.003 |
| 945.898 | -0.004 |
| 946.068 | -0.003 |
| 946.239 | -0.003 |
| 946.409 | -0.004 |
| 946.58 | -0.006 |
| 946.75 | -0.001 |
| 946.921 | -0.002 |
| 947.091 | 0.001 |
| 947.262 | 0 |
| 947.432 | 0.001 |
| 947.603 | 0 |
| 947.773 | 0.001 |
| 947.943 | 0.001 |
| 948.114 | -0.001 |
| 948.284 | -0.003 |
| 948.454 | -0.004 |
| 948.624 | -0.002 |
| 948.795 | -0.002 |
| 948.965 | -0.002 |
| 949.135 | -0.002 |
| 949.305 | -0.002 |
| 949.476 | -0.002 |
| 949.646 | -0.001 |
| 949.816 | -0.002 |
| 949.986 | -0.002 |
| 950.156 | -0.001 |
| 950.326 | 0 |
| 950.496 | 0 |
| 950.666 | 0 |
| 950.836 | 0.002 |
| 951.006 | 0 |
| 951.176 | -0.001 |
| 951.346 | -0.004 |
| 951.516 | -0.003 |
| 951.686 | -0.004 |
| 951.856 | -0.004 |
| 952.026 | -0.004 |
| 952.195 | -0.003 |
| 952.365 | -0.002 |
| 952.535 | -0.003 |
| 952.705 | -0.002 |
| 952.875 | -0.003 |
| 953.044 | -0.001 |
| 953.214 | -0.002 |
| 953.384 | -0.002 |
| 953.553 | -0.003 |
| 953.723 | -0.003 |
| 953.893 | -0.001 |
| 954.062 | 0.001 |
| 954.232 | 0 |
| 954.402 | -0.001 |
| 954.571 | -0.003 |
| 954.741 | -0.001 |
| 954.91 | 0.001 |
| 955.08 | -0.001 |
| 955.249 | -0.002 |
| 955.419 | -0.004 |
| 955.588 | -0.002 |
| 955.757 | -0.002 |
| 955.927 | -0.002 |
| 956.096 | -0.002 |
| 956.266 | -0.001 |
| 956.435 | 0 |
| 956.604 | 0 |
| 956.774 | -0.002 |
| 956.943 | -0.002 |
| 957.112 | -0.003 |
| 957.281 | -0.003 |
| 957.45 | -0.004 |
| 957.62 | -0.003 |
| 957.789 | -0.001 |
| 957.958 | -0.002 |
| 958.127 | -0.001 |
| 958.296 | -0.002 |
| 958.465 | -0.001 |
| 958.634 | -0.003 |
| 958.803 | -0.003 |
| 958.972 | -0.006 |
| 959.141 | -0.005 |
| 959.31 | -0.004 |
| 959.479 | 0 |
| 959.648 | 0.001 |
| 959.817 | -0.003 |
| 959.986 | -0.003 |
| 960.155 | -0.003 |
| 960.324 | -0.002 |
| 960.493 | -0.003 |
| 960.662 | -0.003 |
| 960.83 | -0.004 |
| 960.999 | -0.005 |
| 961.168 | -0.004 |
| 961.337 | -0.004 |
| 961.505 | -0.004 |
| 961.674 | -0.005 |
| 961.843 | -0.001 |
| 962.011 | -0.003 |
| 962.18 | -0.004 |
| 962.349 | -0.006 |
| 962.517 | -0.001 |
| 962.686 | -0.002 |
| 962.854 | -0.002 |
| 963.023 | -0.002 |
| 963.192 | -0.001 |
| 963.36 | 0 |
| 963.529 | 0 |
| 963.697 | 0.001 |
| 963.865 | 0 |
| 964.034 | -0.001 |
| 964.202 | -0.002 |
| 964.371 | -0.002 |
| 964.539 | -0.002 |
| 964.707 | -0.002 |
| 964.876 | -0.002 |
| 965.044 | 0.001 |
| 965.212 | 0.001 |
| 965.38 | 0 |
| 965.549 | -0.002 |
| 965.717 | -0.001 |
| 965.885 | -0.003 |
| 966.053 | -0.005 |
| 966.221 | -0.008 |
| 966.389 | -0.01 |
| 966.558 | -0.008 |
| 966.726 | -0.008 |
| 966.894 | -0.005 |
| 967.062 | -0.005 |
| 967.23 | -0.005 |
| 967.398 | -0.007 |
| 967.566 | -0.007 |
| 967.734 | -0.006 |
| 967.902 | -0.004 |
| 968.07 | -0.002 |
| 968.237 | -0.001 |
| 968.405 | -0.002 |
| 968.573 | -0.004 |
| 968.741 | -0.003 |
| 968.909 | -0.005 |
| 969.077 | -0.006 |
| 969.244 | -0.008 |
| 969.412 | -0.002 |
| 969.58 | 0 |
| 969.748 | 0.002 |
| 969.915 | 0 |
| 970.083 | -0.003 |
| 970.251 | -0.007 |
| 970.418 | -0.008 |
| 970.586 | -0.006 |
| 970.753 | -0.004 |
| 970.921 | -0.003 |
| 971.089 | 0 |
| 971.256 | -0.001 |
| 971.424 | -0.001 |
| 971.591 | -0.004 |
| 971.758 | -0.006 |
| 971.926 | -0.005 |
| 972.093 | -0.005 |
| 972.261 | -0.001 |
| 972.428 | -0.004 |
| 972.595 | -0.004 |
| 972.763 | -0.009 |
| 972.93 | -0.006 |
| 973.097 | -0.006 |
| 973.265 | -0.002 |
| 973.432 | -0.001 |
| 973.599 | 0.002 |
| 973.766 | 0.001 |
| 973.934 | -0.001 |
| 974.101 | -0.003 |
| 974.268 | -0.003 |
| 974.435 | -0.003 |
| 974.602 | -0.005 |
| 974.769 | -0.002 |
| 974.936 | -0.001 |
| 975.103 | -0.001 |
| 975.27 | -0.005 |
| 975.437 | -0.006 |
| 975.604 | -0.001 |
| 975.771 | 0 |
| 975.938 | -0.001 |
| 976.105 | -0.003 |
| 976.272 | -0.004 |
| 976.439 | -0.004 |
| 976.606 | -0.004 |
| 976.773 | -0.001 |
| 976.94 | -0.005 |
| 977.106 | -0.006 |
| 977.273 | -0.005 |
| 977.44 | 0.001 |
| 977.607 | -0.002 |
| 977.773 | -0.004 |
| 977.94 | -0.004 |
| 978.107 | -0.002 |
| 978.273 | -0.002 |
| 978.44 | -0.005 |
| 978.607 | -0.007 |
| 978.773 | -0.008 |
| 978.94 | -0.006 |
| 979.106 | -0.003 |
| 979.273 | -0.001 |
| 979.439 | -0.002 |
| 979.606 | -0.005 |
| 979.772 | -0.005 |
| 979.939 | -0.004 |
| 980.105 | -0.003 |
| 980.272 | -0.004 |
| 980.438 | -0.004 |
| 980.604 | -0.005 |
| 980.771 | -0.005 |
| 980.937 | -0.006 |
| 981.103 | -0.011 |
| 981.269 | -0.008 |
| 981.436 | -0.004 |
| 981.602 | 0 |
| 981.768 | -0.003 |
| 981.934 | -0.01 |
| 982.101 | -0.012 |
| 982.267 | -0.011 |
| 982.433 | -0.008 |
| 982.599 | -0.006 |
| 982.765 | -0.006 |
| 982.931 | -0.006 |
| 983.097 | -0.006 |
| 983.263 | -0.007 |
| 983.429 | -0.011 |
| 983.595 | -0.01 |
| 983.761 | -0.013 |
| 983.927 | -0.014 |
| 984.093 | -0.013 |
| 984.259 | -0.011 |
| 984.425 | -0.005 |
| 984.591 | -0.003 |
| 984.756 | -0.005 |
| 984.922 | -0.007 |
| 985.088 | -0.01 |
| 985.254 | -0.006 |
| 985.419 | -0.003 |
| 985.585 | -0.003 |
| 985.751 | -0.004 |
| 985.917 | -0.009 |
| 986.082 | -0.002 |
| 986.248 | -0.003 |
| 986.414 | 0.001 |
| 986.579 | -0.002 |
| 986.745 | 0.003 |
| 986.91 | -0.002 |
| 987.076 | -0.003 |
| 987.241 | -0.006 |
| 987.407 | 0.002 |
| 987.572 | 0.001 |
| 987.738 | -0.001 |
| 987.903 | -0.008 |
| 988.069 | -0.009 |
| 988.234 | -0.007 |
| 988.399 | -0.006 |
| 988.565 | -0.005 |
| 988.73 | -0.005 |
| 988.895 | -0.001 |
| 989.061 | -0.004 |
| 989.226 | -0.01 |
| 989.391 | -0.013 |
| 989.556 | -0.011 |
| 989.722 | -0.003 |
| 989.887 | -0.005 |
| 990.052 | -0.011 |
| 990.217 | -0.014 |
| 990.382 | -0.012 |
| 990.547 | -0.014 |
| 990.712 | -0.012 |
| 990.877 | -0.012 |
| 991.042 | 0.002 |
| 991.207 | 0.002 |
| 991.372 | 0.003 |
| 991.537 | -0.004 |
| 991.702 | -0.007 |
| 991.867 | -0.006 |
| 992.032 | -0.005 |
| 992.197 | -0.004 |
| 992.362 | -0.008 |
| 992.527 | -0.005 |
| 992.692 | -0.001 |
| 992.856 | 0 |
| 993.021 | -0.008 |
| 993.186 | -0.011 |
| 993.351 | -0.009 |
| 993.515 | 0.001 |
| 993.68 | 0.003 |
| 993.845 | -0.002 |
| 994.009 | -0.009 |
| 994.174 | -0.012 |
| 994.339 | -0.011 |
| 994.503 | -0.011 |
| 994.668 | -0.008 |
| 994.832 | -0.01 |
| 994.997 | -0.008 |
| 995.161 | -0.011 |
| 995.326 | 0 |
| 995.49 | -0.006 |
| 995.655 | -0.007 |
| 995.819 | -0.016 |
| 995.983 | -0.017 |
| 996.148 | -0.012 |
| 996.312 | -0.005 |
| 996.477 | -0.001 |
| 996.641 | -0.002 |
| 996.805 | -0.009 |
| 996.969 | -0.009 |
| 997.134 | -0.012 |
| 997.298 | -0.009 |
| 997.462 | -0.01 |
| 997.626 | -0.007 |
| 997.79 | -0.011 |
| 997.955 | -0.008 |
| 998.119 | -0.009 |
| 998.283 | -0.007 |
| 998.447 | -0.015 |
| 998.611 | -0.01 |
| 998.775 | -0.007 |
| 998.939 | 0.009 |
| 999.103 | 0.007 |
| 999.267 | 0.01 |
| 999.431 | 0.004 |
| 999.595 | 0 |
| 999.759 | -0.005 |
| 999.923 | -0.01 |
| 1000.086 | -0.008 |
| 1000.25 | -0.005 |
| 1000.414 | -0.01 |
| 1000.578 | -0.005 |
| 1000.742 | -0.014 |
| 1000.905 | -0.013 |
| 1001.069 | -0.022 |
| 1001.233 | -0.011 |
| 1001.396 | -0.008 |
| 1001.56 | 0.003 |
| 1001.724 | 0.002 |
| 1001.887 | 0.002 |
| 1002.051 | -0.003 |
| 1002.215 | -0.01 |
| 1002.378 | -0.01 |
| 1002.542 | -0.008 |
| 1002.705 | -0.011 |
| 1002.869 | -0.008 |
| 1003.032 | -0.01 |
| 1003.196 | -0.009 |
| 1003.359 | -0.007 |
| 1003.522 | -0.009 |
| 1003.686 | 0.005 |
| 1003.849 | 0.007 |
| 1004.013 | 0.003 |
| 1004.176 | -0.008 |
| 1004.339 | -0.012 |
| 1004.502 | -0.008 |
| 1004.666 | -0.004 |
| 1004.829 | -0.006 |
| 1004.992 | -0.003 |
| 1005.155 | -0.005 |
| 1005.319 | -0.008 |
| 1005.482 | -0.007 |
| 1005.645 | -0.002 |
| 1005.808 | 0.009 |
| 1005.971 | 0.005 |
| 1006.134 | -0.007 |
| 1006.297 | -0.013 |
| 1006.46 | -0.014 |
| 1006.623 | -0.012 |
| 1006.786 | -0.017 |
| 1006.949 | -0.008 |
| 1007.112 | -0.004 |
| 1007.275 | 0 |
| 1007.438 | -0.005 |
| 1007.601 | -0.009 |
| 1007.764 | -0.012 |
| 1007.926 | -0.016 |
| 1008.089 | -0.017 |
| 1008.252 | -0.02 |
| 1008.415 | -0.02 |
| 1008.578 | -0.013 |
| 1008.74 | -0.013 |
| 1008.903 | -0.01 |
| 1009.066 | -0.018 |
| 1009.228 | -0.013 |
| 1009.391 | -0.024 |
| 1009.554 | -0.023 |
| 1009.716 | -0.02 |
| 1009.879 | -0.008 |
| 1010.041 | -0.008 |
| 1010.204 | -0.013 |
| 1010.366 | -0.013 |
| 1010.529 | -0.017 |
| 1010.691 | -0.016 |
| 1010.854 | -0.022 |
| 1011.016 | -0.023 |
| 1011.178 | -0.021 |
| 1011.341 | -0.02 |
| 1011.503 | -0.016 |
| 1011.666 | -0.018 |
| 1011.828 | -0.016 |
| 1011.99 | -0.006 |
| 1012.152 | -0.008 |
| 1012.315 | 0 |
| 1012.477 | -0.01 |
| 1012.639 | -0.011 |
| 1012.801 | -0.02 |
| 1012.963 | -0.032 |
| 1013.126 | -0.032 |
| 1013.288 | -0.032 |
| 1013.45 | -0.009 |
| 1013.612 | -0.01 |
| 1013.774 | -0.01 |
| 1013.936 | -0.025 |
| 1014.098 | -0.019 |
| 1014.26 | -0.01 |
| 1014.422 | -0.006 |
| 1014.584 | -0.003 |
| 1014.746 | -0.02 |
| 1014.908 | -0.02 |
| 1015.069 | -0.028 |
| 1015.231 | -0.014 |
| 1015.393 | 0.002 |
| 1015.555 | 0.01 |
| 1015.717 | 0.005 |
| 1015.879 | -0.015 |
| 1016.04 | -0.013 |
| 1016.202 | -0.011 |
| 1016.364 | 0.01 |
| 1016.525 | 0.005 |
| 1016.687 | 0.013 |
| 1016.849 | 0.002 |
| 1017.01 | 0.002 |
| 1017.172 | -0.015 |
| 1017.333 | -0.021 |
| 1017.495 | -0.021 |
| 1017.657 | -0.01 |
| 1017.818 | -0.008 |
| 1017.98 | -0.012 |
| 1018.141 | -0.02 |
| 1018.302 | -0.026 |
| 1018.464 | -0.024 |
| 1018.625 | -0.021 |
| 1018.787 | -0.015 |
| 1018.948 | -0.008 |
| 1019.109 | 0.004 |
| 1019.271 | -0.006 |
| 1019.432 | -0.016 |
| 1019.593 | -0.029 |
| 1019.754 | -0.038 |
| 1019.916 | -0.041 |
| 1020.077 | -0.038 |
| 1020.238 | -0.021 |
| 1020.399 | -0.011 |
| 1020.56 | -0.009 |
| 1020.721 | -0.015 |
| 1020.883 | -0.015 |
| 1021.044 | -0.027 |
| 1021.205 | -0.003 |
| 1021.366 | 0.003 |
| 1021.527 | 0.018 |
| 1021.688 | -0.003 |
| 1021.849 | 0 |
| 1022.01 | -0.009 |
| 1022.17 | -0.004 |
| 1022.331 | -0.01 |
| 1022.492 | -0.002 |
| 1022.653 | -0.01 |
| 1022.814 | -0.033 |
| 1022.975 | -0.043 |
| 1023.135 | -0.033 |
| 1023.296 | -0.017 |
| 1023.457 | -0.01 |
| 1023.618 | 0.003 |
| 1023.778 | 0.004 |
| 1023.939 | -0.005 |
| 1024.1 | -0.024 |
| 1024.26 | -0.032 |
| 1024.421 | -0.034 |
| 1024.582 | -0.023 |
| 1024.742 | -0.014 |
| 1024.903 | -0.003 |
| 1025.063 | -0.007 |
| 1025.224 | -0.003 |
| 1025.384 | -0.002 |
| 1025.545 | -0.002 |
| 1025.705 | -0.026 |
| 1025.865 | -0.014 |
| 1026.026 | -0.014 |
| 1026.186 | 0.014 |
| 1026.347 | -0.006 |
| 1026.507 | 0.001 |
| 1026.667 | -0.01 |
| 1026.827 | -0.008 |
| 1026.988 | -0.007 |
| 1027.148 | -0.011 |
| 1027.308 | -0.017 |
| 1027.468 | -0.029 |
| 1027.629 | -0.031 |
| 1027.789 | -0.022 |
| 1027.949 | -0.033 |
| 1028.109 | -0.028 |
| 1028.269 | -0.034 |
| 1028.429 | -0.002 |
| 1028.589 | -0.002 |
| 1028.749 | 0.001 |
| 1028.909 | -0.042 |
| 1029.069 | -0.041 |
| 1029.229 | -0.036 |
| 1029.389 | -0.012 |
| 1029.549 | -0.005 |
| 1029.709 | -0.016 |
| 1029.869 | -0.027 |
| 1030.028 | -0.037 |
| 1030.188 | -0.017 |
| 1030.348 | 0.001 |
| 1030.508 | 0.015 |
| 1030.668 | -0.002 |
| 1030.827 | -0.01 |
| 1030.987 | -0.031 |
| 1031.147 | -0.035 |
| 1031.306 | -0.032 |
| 1031.466 | -0.03 |
| 1031.626 | -0.016 |
| 1031.785 | -0.026 |
| 1031.945 | -0.031 |
| 1032.104 | -0.025 |
| 1032.264 | -0.013 |
| 1032.423 | -0.003 |
| 1032.583 | -0.015 |
| 1032.742 | -0.027 |
| 1032.902 | -0.038 |
| 1033.061 | -0.039 |
| 1033.22 | -0.029 |
| 1033.38 | 0.005 |
| 1033.539 | -0.016 |
| 1033.699 | -0.024 |
| 1033.858 | -0.036 |
| 1034.017 | -0.022 |
| 1034.176 | 0.009 |
| 1034.336 | 0.006 |
| 1034.495 | 0.022 |
| 1034.654 | -0.001 |
| 1034.813 | -0.014 |
| 1034.972 | -0.029 |
| 1035.131 | -0.051 |
| 1035.291 | -0.056 |
| 1035.45 | -0.066 |
| 1035.609 | -0.061 |
| 1035.768 | -0.035 |
| 1035.927 | -0.041 |
| 1036.086 | -0.013 |
| 1036.245 | -0.025 |
| 1036.404 | -0.002 |
| 1036.563 | -0.022 |
| 1036.722 | -0.031 |
| 1036.88 | -0.024 |
| 1037.039 | -0.037 |
| 1037.198 | -0.046 |
| 1037.357 | -0.055 |
| 1037.516 | -0.047 |
| 1037.675 | -0.015 |
| 1037.833 | -0.02 |
| 1037.992 | -0.002 |
| 1038.151 | 0.001 |
| 1038.309 | -0.001 |
| 1038.468 | -0.004 |
| 1038.627 | -0.028 |
| 1038.785 | -0.037 |
| 1038.944 | -0.065 |
| 1039.102 | -0.071 |
| 1039.261 | -0.05 |
| 1039.42 | -0.036 |
| 1039.578 | -0.045 |
| 1039.737 | -0.065 |
| 1039.895 | -0.056 |
| 1040.053 | -0.031 |
| 1040.212 | -0.018 |
| 1040.37 | -0.01 |